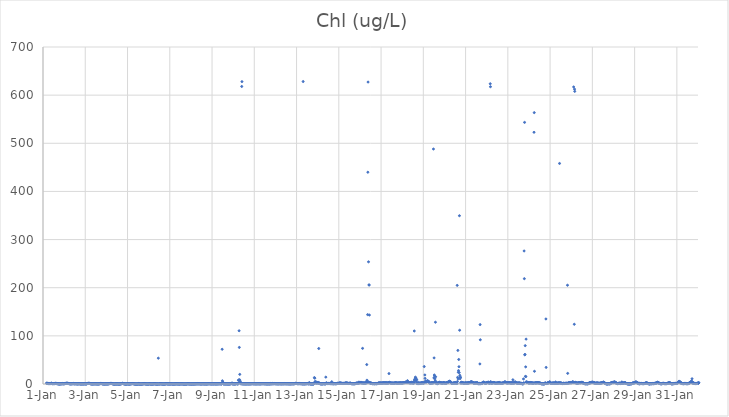
| Category | Chl (ug/L) |
|---|---|
| 44927.166666666664 | 1.62 |
| 44927.177083333336 | 1.46 |
| 44927.1875 | 1.29 |
| 44927.197916666664 | 1.34 |
| 44927.208333333336 | 1.28 |
| 44927.21875 | 1.24 |
| 44927.229166666664 | 1.07 |
| 44927.239583333336 | 1.19 |
| 44927.25 | 1.12 |
| 44927.260416666664 | 0.93 |
| 44927.270833333336 | 0.9 |
| 44927.28125 | 0.76 |
| 44927.291666666664 | 0.87 |
| 44927.302083333336 | 0.89 |
| 44927.3125 | 1.02 |
| 44927.322916666664 | 0.82 |
| 44927.333333333336 | 1 |
| 44927.34375 | 0.92 |
| 44927.354166666664 | 0.98 |
| 44927.364583333336 | 0.98 |
| 44927.375 | 1.19 |
| 44927.385416666664 | 1.48 |
| 44927.395833333336 | 1.44 |
| 44927.40625 | 1.44 |
| 44927.416666666664 | 0.9 |
| 44927.427083333336 | 1.05 |
| 44927.4375 | 0.78 |
| 44927.447916666664 | 0.77 |
| 44927.458333333336 | 0.76 |
| 44927.46875 | 0.76 |
| 44927.479166666664 | 0.8 |
| 44927.489583333336 | 0.79 |
| 44927.5 | 0.9 |
| 44927.510416666664 | 0.76 |
| 44927.520833333336 | 0.71 |
| 44927.53125 | 0.83 |
| 44927.541666666664 | 0.79 |
| 44927.552083333336 | 0.93 |
| 44927.5625 | 1.12 |
| 44927.572916666664 | 1.22 |
| 44927.583333333336 | 1.12 |
| 44927.59375 | 1.28 |
| 44927.604166666664 | 1.14 |
| 44927.614583333336 | 0.78 |
| 44927.625 | 0.62 |
| 44927.635416666664 | 1.13 |
| 44927.645833333336 | 1 |
| 44927.65625 | 1.3 |
| 44927.666666666664 | 0.84 |
| 44927.677083333336 | 0.74 |
| 44927.6875 | 0.61 |
| 44927.697916666664 | 0.71 |
| 44927.708333333336 | 0.53 |
| 44927.71875 | 0.44 |
| 44927.729166666664 | 0.38 |
| 44927.739583333336 | 0.39 |
| 44927.75 | 0.42 |
| 44927.760416666664 | 0.35 |
| 44927.770833333336 | 0.23 |
| 44927.78125 | 0.2 |
| 44927.791666666664 | 0.32 |
| 44927.802083333336 | 0.32 |
| 44927.8125 | 0.39 |
| 44927.822916666664 | 0.37 |
| 44927.833333333336 | 0.41 |
| 44927.84375 | 0.5 |
| 44927.854166666664 | 0.48 |
| 44927.864583333336 | 0.61 |
| 44927.875 | 0.53 |
| 44927.885416666664 | 0.54 |
| 44927.895833333336 | 0.56 |
| 44927.90625 | 0.61 |
| 44927.916666666664 | 1.15 |
| 44927.927083333336 | 0.53 |
| 44927.9375 | 0.47 |
| 44927.947916666664 | 0.58 |
| 44927.958333333336 | 0.48 |
| 44927.96875 | 0.55 |
| 44927.979166666664 | 0.62 |
| 44927.989583333336 | 0.61 |
| 44928.0 | 0.63 |
| 44928.010416666664 | 0.57 |
| 44928.020833333336 | 0.76 |
| 44928.03125 | 1.01 |
| 44928.041666666664 | 1.08 |
| 44928.052083333336 | 1.03 |
| 44928.0625 | 1.13 |
| 44928.072916666664 | 1.13 |
| 44928.083333333336 | 1.21 |
| 44928.09375 | 1.23 |
| 44928.104166666664 | 1.37 |
| 44928.114583333336 | 1.41 |
| 44928.125 | 1.52 |
| 44928.135416666664 | 1.38 |
| 44928.145833333336 | 1.45 |
| 44928.15625 | 1.47 |
| 44928.166666666664 | 1.27 |
| 44928.177083333336 | 1.21 |
| 44928.1875 | 1.04 |
| 44928.197916666664 | 1.23 |
| 44928.208333333336 | 1.02 |
| 44928.21875 | 0.82 |
| 44928.229166666664 | 0.87 |
| 44928.239583333336 | 0.7 |
| 44928.25 | 0.67 |
| 44928.260416666664 | 0.64 |
| 44928.270833333336 | 0.51 |
| 44928.28125 | 0.47 |
| 44928.291666666664 | 0.48 |
| 44928.302083333336 | 0.51 |
| 44928.3125 | 0.41 |
| 44928.322916666664 | 0.45 |
| 44928.333333333336 | 0.54 |
| 44928.34375 | 0.48 |
| 44928.354166666664 | 0.48 |
| 44928.364583333336 | 0.57 |
| 44928.375 | 0.67 |
| 44928.385416666664 | 0.68 |
| 44928.395833333336 | 0.59 |
| 44928.40625 | 0.73 |
| 44928.416666666664 | 0.72 |
| 44928.427083333336 | 0.86 |
| 44928.4375 | 1.18 |
| 44928.447916666664 | 0.52 |
| 44928.458333333336 | 0.6 |
| 44928.46875 | 0.5 |
| 44928.479166666664 | 0.46 |
| 44928.489583333336 | 0.65 |
| 44928.5 | 0.54 |
| 44928.510416666664 | 0.52 |
| 44928.520833333336 | 0.6 |
| 44928.53125 | 0.65 |
| 44928.541666666664 | 0.55 |
| 44928.552083333336 | 0.58 |
| 44928.5625 | 0.59 |
| 44928.572916666664 | 0.48 |
| 44928.583333333336 | 0.48 |
| 44928.59375 | 0.46 |
| 44928.604166666664 | 0.5 |
| 44928.614583333336 | 0.46 |
| 44928.625 | 0.42 |
| 44928.635416666664 | 0.28 |
| 44928.645833333336 | 0.43 |
| 44928.65625 | 0.39 |
| 44928.666666666664 | 0.41 |
| 44928.677083333336 | 0.36 |
| 44928.6875 | 0.57 |
| 44928.697916666664 | 0.75 |
| 44928.708333333336 | 0.72 |
| 44928.71875 | 0.43 |
| 44928.729166666664 | 0.57 |
| 44928.739583333336 | 0.57 |
| 44928.75 | 0.45 |
| 44928.760416666664 | 0.35 |
| 44928.770833333336 | 0.36 |
| 44928.78125 | 0.36 |
| 44928.791666666664 | 0.3 |
| 44928.802083333336 | 0.15 |
| 44928.8125 | 0.44 |
| 44928.822916666664 | 0.44 |
| 44928.833333333336 | 0.32 |
| 44928.84375 | 0.28 |
| 44928.854166666664 | 0.38 |
| 44928.864583333336 | 0.4 |
| 44928.875 | 0.39 |
| 44928.885416666664 | 0.36 |
| 44928.895833333336 | 0.37 |
| 44928.90625 | 0.27 |
| 44928.916666666664 | 0.37 |
| 44928.927083333336 | 0.31 |
| 44928.9375 | 0.45 |
| 44928.947916666664 | 0.68 |
| 44928.958333333336 | 0.43 |
| 44928.96875 | 0.44 |
| 44928.979166666664 | 0.36 |
| 44928.989583333336 | 0.47 |
| 44929.0 | 0.26 |
| 44929.010416666664 | 0.45 |
| 44929.020833333336 | 0.38 |
| 44929.03125 | 0.33 |
| 44929.041666666664 | 0.3 |
| 44929.052083333336 | 0.28 |
| 44929.0625 | 0.49 |
| 44929.072916666664 | 0.59 |
| 44929.083333333336 | 0.7 |
| 44929.09375 | 0.87 |
| 44929.104166666664 | 1.04 |
| 44929.114583333336 | 1.15 |
| 44929.125 | 1.02 |
| 44929.135416666664 | 1.02 |
| 44929.145833333336 | 1.18 |
| 44929.15625 | 1.23 |
| 44929.166666666664 | 1.52 |
| 44929.177083333336 | 1.23 |
| 44929.1875 | 1.27 |
| 44929.197916666664 | 1.28 |
| 44929.208333333336 | 1.11 |
| 44929.21875 | 0.99 |
| 44929.229166666664 | 0.86 |
| 44929.239583333336 | 0.62 |
| 44929.25 | 0.74 |
| 44929.260416666664 | 0.49 |
| 44929.270833333336 | 0.5 |
| 44929.28125 | 0.39 |
| 44929.291666666664 | 0.3 |
| 44929.302083333336 | 0.37 |
| 44929.3125 | 0.29 |
| 44929.322916666664 | 0.38 |
| 44929.333333333336 | 0.35 |
| 44929.34375 | 0.34 |
| 44929.354166666664 | 0.31 |
| 44929.364583333336 | 0.27 |
| 44929.375 | 0.38 |
| 44929.385416666664 | 0.38 |
| 44929.395833333336 | 0.47 |
| 44929.40625 | 0.36 |
| 44929.416666666664 | 0.46 |
| 44929.427083333336 | 0.42 |
| 44929.4375 | 0.46 |
| 44929.447916666664 | 0.43 |
| 44929.458333333336 | 0.66 |
| 44929.46875 | 0.42 |
| 44929.479166666664 | 0.45 |
| 44929.489583333336 | 0.45 |
| 44929.5 | 0.51 |
| 44929.510416666664 | 0.41 |
| 44929.520833333336 | 0.44 |
| 44929.53125 | 0.41 |
| 44929.541666666664 | 0.35 |
| 44929.552083333336 | 0.45 |
| 44929.5625 | 0.25 |
| 44929.572916666664 | 0.43 |
| 44929.583333333336 | 0.26 |
| 44929.59375 | 0.26 |
| 44929.604166666664 | 0.25 |
| 44929.614583333336 | 0.37 |
| 44929.625 | 0.22 |
| 44929.635416666664 | 0.35 |
| 44929.645833333336 | 0.4 |
| 44929.65625 | 0.53 |
| 44929.666666666664 | 0.45 |
| 44929.677083333336 | 0.54 |
| 44929.6875 | 0.62 |
| 44929.697916666664 | 0.72 |
| 44929.708333333336 | 0.56 |
| 44929.71875 | 1.03 |
| 44929.729166666664 | 1.12 |
| 44929.739583333336 | 1.1 |
| 44929.75 | 1.09 |
| 44929.760416666664 | 0.93 |
| 44929.770833333336 | 0.91 |
| 44929.78125 | 0.77 |
| 44929.791666666664 | 0.61 |
| 44929.802083333336 | 0.46 |
| 44929.8125 | 0.41 |
| 44929.822916666664 | 0.51 |
| 44929.833333333336 | 0.43 |
| 44929.84375 | 0.22 |
| 44929.854166666664 | 0.31 |
| 44929.864583333336 | 0.37 |
| 44929.875 | 0.35 |
| 44929.885416666664 | 0.21 |
| 44929.895833333336 | 0.27 |
| 44929.90625 | 0.21 |
| 44929.916666666664 | 0.15 |
| 44929.927083333336 | 0.25 |
| 44929.9375 | 0.21 |
| 44929.947916666664 | 0.31 |
| 44929.958333333336 | 0.33 |
| 44929.96875 | 0.36 |
| 44929.979166666664 | 0.27 |
| 44929.989583333336 | 0.46 |
| 44930.0 | 0.3 |
| 44930.010416666664 | 0.21 |
| 44930.020833333336 | 0.35 |
| 44930.03125 | 0.39 |
| 44930.041666666664 | 0.25 |
| 44930.052083333336 | 0.4 |
| 44930.0625 | 0.34 |
| 44930.072916666664 | 0.35 |
| 44930.083333333336 | 0.36 |
| 44930.09375 | 0.3 |
| 44930.104166666664 | 0.64 |
| 44930.114583333336 | 0.56 |
| 44930.125 | 0.8 |
| 44930.135416666664 | 0.78 |
| 44930.145833333336 | 0.84 |
| 44930.15625 | 0.8 |
| 44930.166666666664 | 0.83 |
| 44930.177083333336 | 1.03 |
| 44930.1875 | 1.09 |
| 44930.197916666664 | 1.13 |
| 44930.208333333336 | 0.98 |
| 44930.21875 | 1.17 |
| 44930.229166666664 | 1.16 |
| 44930.239583333336 | 1.05 |
| 44930.25 | 1 |
| 44930.260416666664 | 1.04 |
| 44930.270833333336 | 0.82 |
| 44930.28125 | 0.79 |
| 44930.291666666664 | 0.57 |
| 44930.302083333336 | 0.45 |
| 44930.3125 | 0.35 |
| 44930.322916666664 | 0.26 |
| 44930.333333333336 | 0.26 |
| 44930.34375 | 0.24 |
| 44930.354166666664 | 0.13 |
| 44930.364583333336 | 0.09 |
| 44930.375 | 0.08 |
| 44930.385416666664 | 0.1 |
| 44930.395833333336 | 0.13 |
| 44930.40625 | 0.16 |
| 44930.416666666664 | 0.12 |
| 44930.427083333336 | 0.21 |
| 44930.4375 | 0.2 |
| 44930.447916666664 | 0.64 |
| 44930.458333333336 | 0.23 |
| 44930.46875 | 0.17 |
| 44930.479166666664 | 0.2 |
| 44930.489583333336 | 0.24 |
| 44930.5 | 0.3 |
| 44930.510416666664 | 0.75 |
| 44930.520833333336 | 0.15 |
| 44930.53125 | 0.21 |
| 44930.541666666664 | 0.25 |
| 44930.552083333336 | 0.14 |
| 44930.5625 | 0.07 |
| 44930.572916666664 | 0.16 |
| 44930.583333333336 | 0.19 |
| 44930.59375 | 0.17 |
| 44930.604166666664 | 0.25 |
| 44930.614583333336 | 0.16 |
| 44930.625 | 0.06 |
| 44930.635416666664 | 0.09 |
| 44930.645833333336 | 0.11 |
| 44930.65625 | 0.27 |
| 44930.666666666664 | 0.58 |
| 44930.677083333336 | 0.3 |
| 44930.6875 | 0.58 |
| 44930.697916666664 | 0.26 |
| 44930.708333333336 | 0.67 |
| 44930.71875 | 0.91 |
| 44930.729166666664 | 0.8 |
| 44930.739583333336 | 1.09 |
| 44930.75 | 1.17 |
| 44930.760416666664 | 1.27 |
| 44930.770833333336 | 1.28 |
| 44930.78125 | 1.15 |
| 44930.791666666664 | 0.84 |
| 44930.802083333336 | 0.6 |
| 44930.8125 | 0.88 |
| 44930.822916666664 | 0.6 |
| 44930.833333333336 | 0.47 |
| 44930.84375 | 0.54 |
| 44930.854166666664 | 0.35 |
| 44930.864583333336 | 0.31 |
| 44930.875 | 0.14 |
| 44930.885416666664 | 0.11 |
| 44930.895833333336 | 0.17 |
| 44930.90625 | 0.16 |
| 44930.916666666664 | 0.13 |
| 44930.927083333336 | 0.12 |
| 44930.9375 | 0.11 |
| 44930.947916666664 | 0.13 |
| 44930.958333333336 | 0.2 |
| 44930.96875 | 0.24 |
| 44930.979166666664 | 0.35 |
| 44930.989583333336 | 0.37 |
| 44931.0 | 0.48 |
| 44931.010416666664 | 0.37 |
| 44931.020833333336 | 0.38 |
| 44931.03125 | 0.19 |
| 44931.041666666664 | 0.2 |
| 44931.052083333336 | 0.26 |
| 44931.0625 | 0.3 |
| 44931.072916666664 | 0.16 |
| 44931.083333333336 | 0.21 |
| 44931.09375 | 0.19 |
| 44931.104166666664 | 0.2 |
| 44931.114583333336 | 0.21 |
| 44931.125 | 0.24 |
| 44931.135416666664 | 0.32 |
| 44931.145833333336 | 0.5 |
| 44931.15625 | 0.53 |
| 44931.166666666664 | 0.63 |
| 44931.177083333336 | 0.62 |
| 44931.1875 | 0.59 |
| 44931.197916666664 | 0.59 |
| 44931.208333333336 | 0.66 |
| 44931.21875 | 0.74 |
| 44931.229166666664 | 0.89 |
| 44931.239583333336 | 0.81 |
| 44931.25 | 0.86 |
| 44931.260416666664 | 0.96 |
| 44931.270833333336 | 0.62 |
| 44931.28125 | 0.7 |
| 44931.291666666664 | 0.54 |
| 44931.302083333336 | 0.49 |
| 44931.3125 | 0.38 |
| 44931.322916666664 | 0.26 |
| 44931.333333333336 | 0.28 |
| 44931.34375 | 0.28 |
| 44931.354166666664 | 0.14 |
| 44931.364583333336 | 0.05 |
| 44931.375 | 0.07 |
| 44931.385416666664 | 0.11 |
| 44931.395833333336 | 0.1 |
| 44931.40625 | 0.09 |
| 44931.416666666664 | 0.12 |
| 44931.427083333336 | 0.1 |
| 44931.4375 | 0.14 |
| 44931.447916666664 | 0.16 |
| 44931.458333333336 | 0.03 |
| 44931.46875 | 0.17 |
| 44931.479166666664 | 0.1 |
| 44931.489583333336 | 0.22 |
| 44931.5 | 0.24 |
| 44931.510416666664 | 0.22 |
| 44931.520833333336 | 0.14 |
| 44931.53125 | 0.27 |
| 44931.541666666664 | 1.46 |
| 44931.552083333336 | 0.16 |
| 44931.5625 | 0.15 |
| 44931.572916666664 | 0.12 |
| 44931.583333333336 | 0.12 |
| 44931.59375 | 0.13 |
| 44931.604166666664 | 0.18 |
| 44931.614583333336 | 0.12 |
| 44931.625 | 0.26 |
| 44931.635416666664 | 0.1 |
| 44931.645833333336 | 0.08 |
| 44931.65625 | 0.15 |
| 44931.666666666664 | 0.18 |
| 44931.677083333336 | 0.08 |
| 44931.6875 | 0.23 |
| 44931.697916666664 | 0.35 |
| 44931.708333333336 | 0.33 |
| 44931.71875 | 0.38 |
| 44931.729166666664 | 0.19 |
| 44931.739583333336 | 0.36 |
| 44931.75 | 0.64 |
| 44931.760416666664 | 0.51 |
| 44931.770833333336 | 0.67 |
| 44931.78125 | 0.85 |
| 44931.791666666664 | 0.94 |
| 44931.802083333336 | 0.53 |
| 44931.8125 | 0.72 |
| 44931.822916666664 | 0.42 |
| 44931.833333333336 | 0.37 |
| 44931.84375 | 0.34 |
| 44931.854166666664 | 0.36 |
| 44931.864583333336 | 0.28 |
| 44931.875 | 0.32 |
| 44931.885416666664 | 0.25 |
| 44931.895833333336 | 0.18 |
| 44931.90625 | 0.18 |
| 44931.916666666664 | 0.2 |
| 44931.927083333336 | 0.23 |
| 44931.9375 | 0.12 |
| 44931.947916666664 | 0.14 |
| 44931.958333333336 | 0.27 |
| 44931.96875 | 0.16 |
| 44931.979166666664 | 0.17 |
| 44931.989583333336 | 0.24 |
| 44932.0 | 0.16 |
| 44932.010416666664 | 0.2 |
| 44932.020833333336 | 0.17 |
| 44932.03125 | 0.76 |
| 44932.041666666664 | 0.43 |
| 44932.052083333336 | 0.5 |
| 44932.0625 | 0.4 |
| 44932.072916666664 | 0.19 |
| 44932.083333333336 | 0.17 |
| 44932.09375 | 0.22 |
| 44932.104166666664 | 0.3 |
| 44932.114583333336 | 0.22 |
| 44932.125 | 0.22 |
| 44932.135416666664 | 0.23 |
| 44932.145833333336 | 0.13 |
| 44932.15625 | 0.17 |
| 44932.166666666664 | 0.13 |
| 44932.177083333336 | 0.29 |
| 44932.1875 | 0.19 |
| 44932.197916666664 | 0.2 |
| 44932.208333333336 | 0.31 |
| 44932.21875 | 0.29 |
| 44932.229166666664 | 0.36 |
| 44932.239583333336 | 0.38 |
| 44932.25 | 0.37 |
| 44932.260416666664 | 0.42 |
| 44932.270833333336 | 0.59 |
| 44932.28125 | 0.5 |
| 44932.291666666664 | 0.52 |
| 44932.302083333336 | 0.46 |
| 44932.3125 | 0.43 |
| 44932.322916666664 | 0.25 |
| 44932.333333333336 | 0.29 |
| 44932.34375 | 0.18 |
| 44932.354166666664 | 0.16 |
| 44932.364583333336 | 0.24 |
| 44932.375 | 0.15 |
| 44932.385416666664 | 0.11 |
| 44932.395833333336 | 0.13 |
| 44932.40625 | 0.18 |
| 44932.416666666664 | 0.13 |
| 44932.427083333336 | 0.14 |
| 44932.4375 | 0.16 |
| 44932.447916666664 | 0.16 |
| 44932.458333333336 | 53.65 |
| 44932.46875 | 0.1 |
| 44932.479166666664 | 0.21 |
| 44932.489583333336 | 0.18 |
| 44932.5 | 0.25 |
| 44932.510416666664 | 0.28 |
| 44932.520833333336 | 0.38 |
| 44932.53125 | 0.4 |
| 44932.541666666664 | 0.48 |
| 44932.552083333336 | 0.61 |
| 44932.5625 | 0.41 |
| 44932.572916666664 | 0.4 |
| 44932.583333333336 | 0.47 |
| 44932.59375 | 0.38 |
| 44932.604166666664 | 0.5 |
| 44932.614583333336 | 0.21 |
| 44932.625 | 0.24 |
| 44932.635416666664 | 0.33 |
| 44932.645833333336 | 0.31 |
| 44932.65625 | 0.16 |
| 44932.666666666664 | 0.13 |
| 44932.677083333336 | 0.09 |
| 44932.6875 | 0.12 |
| 44932.697916666664 | 0.15 |
| 44932.708333333336 | 0.22 |
| 44932.71875 | 0.11 |
| 44932.729166666664 | 0.1 |
| 44932.739583333336 | 0.1 |
| 44932.75 | 0.16 |
| 44932.760416666664 | 0.09 |
| 44932.770833333336 | 0.29 |
| 44932.78125 | 0.34 |
| 44932.791666666664 | 0.28 |
| 44932.802083333336 | 0.18 |
| 44932.8125 | 0.45 |
| 44932.822916666664 | 0.68 |
| 44932.833333333336 | 0.7 |
| 44932.84375 | 0.66 |
| 44932.854166666664 | 0.52 |
| 44932.864583333336 | 0.37 |
| 44932.875 | 0.37 |
| 44932.885416666664 | 0.39 |
| 44932.895833333336 | 0.32 |
| 44932.90625 | 0.34 |
| 44932.916666666664 | 0.38 |
| 44932.927083333336 | 0.34 |
| 44932.9375 | 0.16 |
| 44932.947916666664 | 0.31 |
| 44932.958333333336 | 0.34 |
| 44932.96875 | 0.32 |
| 44932.979166666664 | 0.23 |
| 44932.989583333336 | 0.29 |
| 44933.0 | 0.34 |
| 44933.010416666664 | 0.14 |
| 44933.020833333336 | 0.25 |
| 44933.03125 | 0.26 |
| 44933.041666666664 | 0.31 |
| 44933.052083333336 | 0.38 |
| 44933.0625 | 0.44 |
| 44933.072916666664 | 0.56 |
| 44933.083333333336 | 0.41 |
| 44933.09375 | 0.3 |
| 44933.104166666664 | 0.28 |
| 44933.114583333336 | 0.25 |
| 44933.125 | 0.18 |
| 44933.135416666664 | 0.28 |
| 44933.145833333336 | 0.11 |
| 44933.15625 | 0.31 |
| 44933.166666666664 | 0.18 |
| 44933.177083333336 | 0.2 |
| 44933.1875 | 0.17 |
| 44933.197916666664 | 0.17 |
| 44933.208333333336 | 0.14 |
| 44933.21875 | 0.28 |
| 44933.229166666664 | 0.27 |
| 44933.239583333336 | 0.23 |
| 44933.25 | 0.33 |
| 44933.260416666664 | 0.31 |
| 44933.270833333336 | 0.36 |
| 44933.28125 | 0.33 |
| 44933.291666666664 | 0.36 |
| 44933.302083333336 | 0.37 |
| 44933.3125 | 0.41 |
| 44933.322916666664 | 0.49 |
| 44933.333333333336 | 0.41 |
| 44933.34375 | 0.4 |
| 44933.354166666664 | 0.33 |
| 44933.364583333336 | 0.36 |
| 44933.375 | 0.29 |
| 44933.385416666664 | 0.29 |
| 44933.395833333336 | 0.26 |
| 44933.40625 | 0.3 |
| 44933.416666666664 | 0.31 |
| 44933.427083333336 | 0.34 |
| 44933.4375 | 0.21 |
| 44933.447916666664 | 0.14 |
| 44933.458333333336 | 0.22 |
| 44933.46875 | 0.26 |
| 44933.479166666664 | 0.25 |
| 44933.489583333336 | 0.17 |
| 44933.5 | 0.33 |
| 44933.510416666664 | 0.52 |
| 44933.520833333336 | 0.36 |
| 44933.53125 | 0.4 |
| 44933.541666666664 | 0.39 |
| 44933.552083333336 | 0.4 |
| 44933.5625 | 0.32 |
| 44933.572916666664 | 0.39 |
| 44933.583333333336 | 0.42 |
| 44933.59375 | 0.65 |
| 44933.604166666664 | 0.39 |
| 44933.614583333336 | 0.22 |
| 44933.625 | 0.2 |
| 44933.635416666664 | 0.13 |
| 44933.645833333336 | 0.24 |
| 44933.65625 | 0.22 |
| 44933.666666666664 | 0.13 |
| 44933.677083333336 | 0.12 |
| 44933.6875 | 0.16 |
| 44933.697916666664 | 0.21 |
| 44933.708333333336 | 0.15 |
| 44933.71875 | 0.15 |
| 44933.729166666664 | 0.16 |
| 44933.739583333336 | 0.17 |
| 44933.75 | 0.2 |
| 44933.760416666664 | 0.15 |
| 44933.770833333336 | 0.14 |
| 44933.78125 | 0.21 |
| 44933.791666666664 | 0.2 |
| 44933.802083333336 | 0.27 |
| 44933.8125 | 0.2 |
| 44933.822916666664 | 0.29 |
| 44933.833333333336 | 0.5 |
| 44933.84375 | 0.63 |
| 44933.854166666664 | 0.59 |
| 44933.864583333336 | 0.71 |
| 44933.875 | 0.51 |
| 44933.885416666664 | 0.38 |
| 44933.895833333336 | 0.34 |
| 44933.90625 | 0.42 |
| 44933.916666666664 | 0.34 |
| 44933.927083333336 | 0.28 |
| 44933.9375 | 0.28 |
| 44933.947916666664 | 0.35 |
| 44933.958333333336 | 0.34 |
| 44933.96875 | 0.26 |
| 44933.979166666664 | 0.27 |
| 44933.989583333336 | 0.25 |
| 44934.0 | 0.29 |
| 44934.010416666664 | 0.26 |
| 44934.020833333336 | 0.19 |
| 44934.03125 | 0.17 |
| 44934.041666666664 | 0.3 |
| 44934.052083333336 | 0.2 |
| 44934.0625 | 0.29 |
| 44934.072916666664 | 0.27 |
| 44934.083333333336 | 0.38 |
| 44934.09375 | 0.2 |
| 44934.104166666664 | 0.37 |
| 44934.114583333336 | 0.29 |
| 44934.125 | 0.24 |
| 44934.135416666664 | 0.13 |
| 44934.145833333336 | 0.27 |
| 44934.15625 | 0.29 |
| 44934.166666666664 | 0.37 |
| 44934.177083333336 | 0.28 |
| 44934.1875 | 0.41 |
| 44934.197916666664 | 0.29 |
| 44934.208333333336 | 0.33 |
| 44934.21875 | 0.37 |
| 44934.229166666664 | 0.38 |
| 44934.239583333336 | 0.47 |
| 44934.25 | 0.4 |
| 44934.260416666664 | 0.48 |
| 44934.270833333336 | 0.48 |
| 44934.28125 | 0.49 |
| 44934.291666666664 | 0.44 |
| 44934.302083333336 | 0.4 |
| 44934.3125 | 0.47 |
| 44934.322916666664 | 0.55 |
| 44934.333333333336 | 1 |
| 44934.34375 | 0.53 |
| 44934.354166666664 | 0.53 |
| 44934.364583333336 | 0.46 |
| 44934.375 | 0.46 |
| 44934.385416666664 | 0.37 |
| 44934.395833333336 | 0.55 |
| 44934.40625 | 0.59 |
| 44934.416666666664 | 0.45 |
| 44934.427083333336 | 0.36 |
| 44934.4375 | 0.4 |
| 44934.447916666664 | 0.39 |
| 44934.458333333336 | 0.27 |
| 44934.46875 | 0.35 |
| 44934.479166666664 | 0.25 |
| 44934.489583333336 | 0.35 |
| 44934.5 | 0.35 |
| 44934.510416666664 | 0.38 |
| 44934.520833333336 | 0.41 |
| 44934.53125 | 0.39 |
| 44934.541666666664 | 0.49 |
| 44934.552083333336 | 0.46 |
| 44934.5625 | 0.47 |
| 44934.572916666664 | 0.56 |
| 44934.583333333336 | 0.46 |
| 44934.59375 | 0.41 |
| 44934.604166666664 | 0.42 |
| 44934.614583333336 | 0.37 |
| 44934.625 | 0.29 |
| 44934.635416666664 | 0.35 |
| 44934.645833333336 | 0.3 |
| 44934.65625 | 0.37 |
| 44934.666666666664 | 0.43 |
| 44934.677083333336 | 0.31 |
| 44934.6875 | 0.27 |
| 44934.697916666664 | 0.33 |
| 44934.708333333336 | 0.42 |
| 44934.71875 | 0.3 |
| 44934.729166666664 | 0.31 |
| 44934.739583333336 | 0.23 |
| 44934.75 | 0.21 |
| 44934.760416666664 | 0.31 |
| 44934.770833333336 | 0.39 |
| 44934.78125 | 0.29 |
| 44934.791666666664 | 0.52 |
| 44934.802083333336 | 0.43 |
| 44934.8125 | 0.57 |
| 44934.822916666664 | 0.52 |
| 44934.833333333336 | 0.4 |
| 44934.84375 | 0.73 |
| 44934.854166666664 | 0.46 |
| 44934.864583333336 | 0.37 |
| 44934.875 | 0.57 |
| 44934.885416666664 | 0.69 |
| 44934.895833333336 | 0.53 |
| 44934.90625 | 0.55 |
| 44934.916666666664 | 0.45 |
| 44934.927083333336 | 0.38 |
| 44934.9375 | 0.47 |
| 44934.947916666664 | 0.37 |
| 44934.958333333336 | 0.38 |
| 44934.96875 | 0.37 |
| 44934.979166666664 | 0.38 |
| 44934.989583333336 | 0.36 |
| 44935.0 | 0.38 |
| 44935.010416666664 | 0.46 |
| 44935.020833333336 | 0.39 |
| 44935.03125 | 0.49 |
| 44935.041666666664 | 0.43 |
| 44935.052083333336 | 0.27 |
| 44935.0625 | 0.33 |
| 44935.072916666664 | 0.33 |
| 44935.083333333336 | 0.47 |
| 44935.09375 | 0.5 |
| 44935.104166666664 | 0.47 |
| 44935.114583333336 | 0.53 |
| 44935.125 | 0.52 |
| 44935.135416666664 | 0.31 |
| 44935.145833333336 | 0.35 |
| 44935.15625 | 0.42 |
| 44935.166666666664 | 0.4 |
| 44935.177083333336 | 0.29 |
| 44935.1875 | 0.37 |
| 44935.197916666664 | 0.33 |
| 44935.208333333336 | 0.36 |
| 44935.21875 | 0.48 |
| 44935.229166666664 | 0.37 |
| 44935.239583333336 | 0.33 |
| 44935.25 | 0.51 |
| 44935.260416666664 | 0.42 |
| 44935.270833333336 | 0.39 |
| 44935.28125 | 0.49 |
| 44935.291666666664 | 0.44 |
| 44935.302083333336 | 0.46 |
| 44935.3125 | 0.48 |
| 44935.322916666664 | 0.58 |
| 44935.333333333336 | 0.47 |
| 44935.34375 | 0.52 |
| 44935.354166666664 | 0.65 |
| 44935.364583333336 | 0.58 |
| 44935.375 | 0.49 |
| 44935.385416666664 | 0.55 |
| 44935.395833333336 | 0.57 |
| 44935.40625 | 0.45 |
| 44935.416666666664 | 0.52 |
| 44935.427083333336 | 0.4 |
| 44935.4375 | 0.37 |
| 44935.447916666664 | 0.42 |
| 44935.458333333336 | 0.45 |
| 44935.46875 | 0.36 |
| 44935.479166666664 | 72.11 |
| 44935.489583333336 | 6.62 |
| 44935.5 | 2.35 |
| 44935.510416666664 | 3.86 |
| 44935.520833333336 | 3.15 |
| 44935.53125 | 1.41 |
| 44935.541666666664 | 0.26 |
| 44935.552083333336 | 0.33 |
| 44935.5625 | 0.33 |
| 44935.572916666664 | 0.35 |
| 44935.583333333336 | 0.33 |
| 44935.59375 | 0.44 |
| 44935.604166666664 | 0.36 |
| 44935.614583333336 | 0.42 |
| 44935.625 | 0.38 |
| 44935.635416666664 | 0.27 |
| 44935.645833333336 | 0.31 |
| 44935.65625 | 0.35 |
| 44935.666666666664 | 0.36 |
| 44935.677083333336 | 0.35 |
| 44935.6875 | 0.35 |
| 44935.697916666664 | 0.35 |
| 44935.708333333336 | 0.35 |
| 44935.71875 | 0.3 |
| 44935.729166666664 | 0.18 |
| 44935.739583333336 | 0.23 |
| 44935.75 | 0.33 |
| 44935.760416666664 | 0.26 |
| 44935.770833333336 | 0.29 |
| 44935.78125 | 0.27 |
| 44935.791666666664 | 0.3 |
| 44935.802083333336 | 0.2 |
| 44935.8125 | 0.21 |
| 44935.822916666664 | 0.24 |
| 44935.833333333336 | 0.31 |
| 44935.84375 | 0.34 |
| 44935.854166666664 | 0.47 |
| 44935.864583333336 | 0.57 |
| 44935.875 | 0.55 |
| 44935.885416666664 | 0.54 |
| 44935.895833333336 | 0.52 |
| 44935.90625 | 0.43 |
| 44935.916666666664 | 1.08 |
| 44935.927083333336 | 1.52 |
| 44935.9375 | 0.86 |
| 44935.947916666664 | 0.75 |
| 44935.958333333336 | 1.86 |
| 44935.96875 | 0.23 |
| 44935.979166666664 | 0.41 |
| 44935.989583333336 | 0.35 |
| 44936.0 | 0.38 |
| 44936.010416666664 | 0.31 |
| 44936.020833333336 | 0.47 |
| 44936.03125 | 0.35 |
| 44936.041666666664 | 0.39 |
| 44936.052083333336 | 0.36 |
| 44936.0625 | 0.23 |
| 44936.072916666664 | 0.29 |
| 44936.083333333336 | 0.34 |
| 44936.09375 | 0.29 |
| 44936.104166666664 | 0.39 |
| 44936.114583333336 | 0.45 |
| 44936.125 | 0.5 |
| 44936.135416666664 | 0.48 |
| 44936.145833333336 | 0.83 |
| 44936.15625 | 0.89 |
| 44936.166666666664 | 0.79 |
| 44936.177083333336 | 0.38 |
| 44936.1875 | 0.49 |
| 44936.197916666664 | 0.45 |
| 44936.208333333336 | 0.46 |
| 44936.21875 | 0.46 |
| 44936.229166666664 | 0.35 |
| 44936.239583333336 | 0.42 |
| 44936.25 | 7.59 |
| 44936.260416666664 | 8.3 |
| 44936.270833333336 | 2.1 |
| 44936.28125 | 110.62 |
| 44936.291666666664 | 75.99 |
| 44936.302083333336 | 8.95 |
| 44936.3125 | 20 |
| 44936.322916666664 | 2.78 |
| 44936.333333333336 | 5.96 |
| 44936.34375 | 3.76 |
| 44936.354166666664 | 0.66 |
| 44936.364583333336 | 0.66 |
| 44936.375 | 0.78 |
| 44936.385416666664 | 0.47 |
| 44936.395833333336 | 0.57 |
| 44936.40625 | 618.04 |
| 44936.416666666664 | 628.09 |
| 44936.427083333336 | 0.56 |
| 44936.4375 | 0.62 |
| 44936.447916666664 | 0.47 |
| 44936.458333333336 | 0.45 |
| 44936.46875 | 0.41 |
| 44936.479166666664 | 0.47 |
| 44936.489583333336 | 0.47 |
| 44936.5 | 0.5 |
| 44936.510416666664 | 0.43 |
| 44936.520833333336 | 0.42 |
| 44936.53125 | 0.38 |
| 44936.541666666664 | 0.43 |
| 44936.552083333336 | 0.43 |
| 44936.5625 | 0.46 |
| 44936.572916666664 | 0.37 |
| 44936.583333333336 | 0.35 |
| 44936.59375 | 0.43 |
| 44936.604166666664 | 0.39 |
| 44936.614583333336 | 0.32 |
| 44936.625 | 0.37 |
| 44936.635416666664 | 0.43 |
| 44936.645833333336 | 0.41 |
| 44936.65625 | 0.49 |
| 44936.666666666664 | 0.5 |
| 44936.677083333336 | 0.49 |
| 44936.6875 | 0.48 |
| 44936.697916666664 | 0.34 |
| 44936.708333333336 | 0.32 |
| 44936.71875 | 0.41 |
| 44936.729166666664 | 0.36 |
| 44936.739583333336 | 0.44 |
| 44936.75 | 0.57 |
| 44936.760416666664 | 0.39 |
| 44936.770833333336 | 0.37 |
| 44936.78125 | 0.48 |
| 44936.791666666664 | 0.34 |
| 44936.802083333336 | 0.43 |
| 44936.8125 | 0.5 |
| 44936.822916666664 | 0.52 |
| 44936.833333333336 | 0.41 |
| 44936.84375 | 0.55 |
| 44936.854166666664 | 0.57 |
| 44936.864583333336 | 0.56 |
| 44936.875 | 0.67 |
| 44936.885416666664 | 0.56 |
| 44936.895833333336 | 0.61 |
| 44936.90625 | 0.85 |
| 44936.916666666664 | 0.62 |
| 44936.927083333336 | 0.65 |
| 44936.9375 | 0.71 |
| 44936.947916666664 | 0.66 |
| 44936.958333333336 | 0.47 |
| 44936.96875 | 0.55 |
| 44936.979166666664 | 0.54 |
| 44936.989583333336 | 0.49 |
| 44937.0 | 0.68 |
| 44937.010416666664 | 0.48 |
| 44937.020833333336 | 0.46 |
| 44937.03125 | 0.62 |
| 44937.041666666664 | 0.41 |
| 44937.052083333336 | 0.52 |
| 44937.0625 | 0.4 |
| 44937.072916666664 | 0.48 |
| 44937.083333333336 | 0.5 |
| 44937.09375 | 0.38 |
| 44937.104166666664 | 0.63 |
| 44937.114583333336 | 0.41 |
| 44937.125 | 0.48 |
| 44937.135416666664 | 0.49 |
| 44937.145833333336 | 0.47 |
| 44937.15625 | 0.56 |
| 44937.166666666664 | 0.53 |
| 44937.177083333336 | 0.56 |
| 44937.1875 | 0.69 |
| 44937.197916666664 | 0.45 |
| 44937.208333333336 | 0.5 |
| 44937.21875 | 0.5 |
| 44937.229166666664 | 0.56 |
| 44937.239583333336 | 0.42 |
| 44937.25 | 0.47 |
| 44937.260416666664 | 0.41 |
| 44937.270833333336 | 0.97 |
| 44937.28125 | 0.46 |
| 44937.291666666664 | 0.42 |
| 44937.302083333336 | 0.44 |
| 44937.3125 | 0.51 |
| 44937.322916666664 | 0.65 |
| 44937.333333333336 | 0.49 |
| 44937.34375 | 0.63 |
| 44937.354166666664 | 0.7 |
| 44937.364583333336 | 0.58 |
| 44937.375 | 0.62 |
| 44937.385416666664 | 0.64 |
| 44937.395833333336 | 0.71 |
| 44937.40625 | 0.7 |
| 44937.416666666664 | 0.73 |
| 44937.427083333336 | 0.63 |
| 44937.4375 | 0.67 |
| 44937.447916666664 | 0.7 |
| 44937.458333333336 | 0.59 |
| 44937.46875 | 0.5 |
| 44937.479166666664 | 0.51 |
| 44937.489583333336 | 0.54 |
| 44937.5 | 0.62 |
| 44937.510416666664 | 0.56 |
| 44937.520833333336 | 0.53 |
| 44937.53125 | 0.47 |
| 44937.541666666664 | 0.55 |
| 44937.552083333336 | 0.55 |
| 44937.5625 | 0.42 |
| 44937.572916666664 | 0.44 |
| 44937.583333333336 | 0.42 |
| 44937.59375 | 0.27 |
| 44937.604166666664 | 0.4 |
| 44937.614583333336 | 0.43 |
| 44937.625 | 0.48 |
| 44937.635416666664 | 0.36 |
| 44937.645833333336 | 0.4 |
| 44937.65625 | 0.41 |
| 44937.666666666664 | 0.37 |
| 44937.677083333336 | 0.46 |
| 44937.6875 | 0.39 |
| 44937.697916666664 | 0.55 |
| 44937.708333333336 | 0.43 |
| 44937.71875 | 0.38 |
| 44937.729166666664 | 0.39 |
| 44937.739583333336 | 0.33 |
| 44937.75 | 0.34 |
| 44937.760416666664 | 0.34 |
| 44937.770833333336 | 1.11 |
| 44937.78125 | 0.4 |
| 44937.791666666664 | 0.54 |
| 44937.802083333336 | 0.67 |
| 44937.8125 | 0.34 |
| 44937.822916666664 | 0.66 |
| 44937.833333333336 | 0.6 |
| 44937.84375 | 0.51 |
| 44937.854166666664 | 0.64 |
| 44937.864583333336 | 0.52 |
| 44937.875 | 1.33 |
| 44937.885416666664 | 0.73 |
| 44937.895833333336 | 0.69 |
| 44937.90625 | 0.68 |
| 44937.916666666664 | 0.68 |
| 44937.927083333336 | 0.69 |
| 44937.9375 | 0.97 |
| 44937.947916666664 | 0.89 |
| 44937.958333333336 | 0.7 |
| 44937.96875 | 0.74 |
| 44937.979166666664 | 0.6 |
| 44937.989583333336 | 0.64 |
| 44938.0 | 0.6 |
| 44938.010416666664 | 0.69 |
| 44938.020833333336 | 0.57 |
| 44938.03125 | 0.59 |
| 44938.041666666664 | 0.61 |
| 44938.052083333336 | 0.58 |
| 44938.0625 | 0.56 |
| 44938.072916666664 | 0.57 |
| 44938.083333333336 | 0.59 |
| 44938.09375 | 0.54 |
| 44938.104166666664 | 0.51 |
| 44938.114583333336 | 0.44 |
| 44938.125 | 0.49 |
| 44938.135416666664 | 0.54 |
| 44938.145833333336 | 0.48 |
| 44938.15625 | 0.54 |
| 44938.166666666664 | 0.52 |
| 44938.177083333336 | 0.51 |
| 44938.1875 | 0.56 |
| 44938.197916666664 | 0.56 |
| 44938.208333333336 | 0.75 |
| 44938.21875 | 0.62 |
| 44938.229166666664 | 0.49 |
| 44938.239583333336 | 0.51 |
| 44938.25 | 0.52 |
| 44938.260416666664 | 0.52 |
| 44938.270833333336 | 0.48 |
| 44938.28125 | 0.49 |
| 44938.291666666664 | 0.46 |
| 44938.302083333336 | 0.42 |
| 44938.3125 | 0.62 |
| 44938.322916666664 | 0.54 |
| 44938.333333333336 | 0.6 |
| 44938.34375 | 0.57 |
| 44938.354166666664 | 0.48 |
| 44938.364583333336 | 0.51 |
| 44938.375 | 0.57 |
| 44938.385416666664 | 0.57 |
| 44938.395833333336 | 0.55 |
| 44938.40625 | 0.52 |
| 44938.416666666664 | 0.59 |
| 44938.427083333336 | 0.52 |
| 44938.4375 | 0.7 |
| 44938.447916666664 | 0.86 |
| 44938.458333333336 | 0.65 |
| 44938.46875 | 0.7 |
| 44938.479166666664 | 0.57 |
| 44938.489583333336 | 0.52 |
| 44938.5 | 0.58 |
| 44938.510416666664 | 0.53 |
| 44938.520833333336 | 0.55 |
| 44938.53125 | 0.52 |
| 44938.541666666664 | 0.58 |
| 44938.552083333336 | 0.56 |
| 44938.5625 | 0.68 |
| 44938.572916666664 | 0.54 |
| 44938.583333333336 | 0.53 |
| 44938.59375 | 0.46 |
| 44938.604166666664 | 0.4 |
| 44938.614583333336 | 0.47 |
| 44938.625 | 0.47 |
| 44938.635416666664 | 0.58 |
| 44938.645833333336 | 0.53 |
| 44938.65625 | 0.43 |
| 44938.666666666664 | 0.41 |
| 44938.677083333336 | 0.45 |
| 44938.6875 | 0.62 |
| 44938.697916666664 | 0.32 |
| 44938.708333333336 | 0.47 |
| 44938.71875 | 0.47 |
| 44938.729166666664 | 0.44 |
| 44938.739583333336 | 0.33 |
| 44938.75 | 0.61 |
| 44938.760416666664 | 0.55 |
| 44938.770833333336 | 0.55 |
| 44938.78125 | 0.53 |
| 44938.791666666664 | 0.58 |
| 44938.802083333336 | 0.63 |
| 44938.8125 | 0.55 |
| 44938.822916666664 | 0.53 |
| 44938.833333333336 | 0.5 |
| 44938.84375 | 0.45 |
| 44938.854166666664 | 0.49 |
| 44938.864583333336 | 0.62 |
| 44938.875 | 0.59 |
| 44938.885416666664 | 0.64 |
| 44938.895833333336 | 0.56 |
| 44938.90625 | 0.84 |
| 44938.916666666664 | 0.79 |
| 44938.927083333336 | 0.73 |
| 44938.9375 | 0.87 |
| 44938.947916666664 | 1.11 |
| 44938.958333333336 | 1.54 |
| 44938.96875 | 1.1 |
| 44938.979166666664 | 0.97 |
| 44938.989583333336 | 1.16 |
| 44939.0 | 1.13 |
| 44939.010416666664 | 0.83 |
| 44939.020833333336 | 1.21 |
| 44939.03125 | 0.73 |
| 44939.041666666664 | 0.69 |
| 44939.052083333336 | 0.95 |
| 44939.0625 | 0.59 |
| 44939.072916666664 | 1.09 |
| 44939.083333333336 | 0.63 |
| 44939.09375 | 0.75 |
| 44939.104166666664 | 0.9 |
| 44939.114583333336 | 0.76 |
| 44939.125 | 0.64 |
| 44939.135416666664 | 0.74 |
| 44939.145833333336 | 1.07 |
| 44939.15625 | 1.13 |
| 44939.166666666664 | 0.96 |
| 44939.177083333336 | 0.74 |
| 44939.1875 | 0.86 |
| 44939.197916666664 | 0.6 |
| 44939.208333333336 | 0.63 |
| 44939.21875 | 0.69 |
| 44939.229166666664 | 0.72 |
| 44939.239583333336 | 0.64 |
| 44939.25 | 0.61 |
| 44939.260416666664 | 0.43 |
| 44939.270833333336 | 0.61 |
| 44939.28125 | 0.41 |
| 44939.291666666664 | 0.4 |
| 44939.302083333336 | 0.52 |
| 44939.3125 | 628.26 |
| 44939.322916666664 | 0.45 |
| 44939.333333333336 | 0.37 |
| 44939.34375 | 0.3 |
| 44939.354166666664 | 0.45 |
| 44939.364583333336 | 0.39 |
| 44939.375 | 0.35 |
| 44939.385416666664 | 0.43 |
| 44939.395833333336 | 0.65 |
| 44939.40625 | 0.48 |
| 44939.416666666664 | 0.54 |
| 44939.427083333336 | 0.56 |
| 44939.4375 | 0.61 |
| 44939.447916666664 | 0.59 |
| 44939.458333333336 | 0.64 |
| 44939.46875 | 0.62 |
| 44939.479166666664 | 0.68 |
| 44939.489583333336 | 0.64 |
| 44939.5 | 0.69 |
| 44939.510416666664 | 0.78 |
| 44939.520833333336 | 0.75 |
| 44939.53125 | 1.04 |
| 44939.541666666664 | 0.74 |
| 44939.552083333336 | 0.67 |
| 44939.5625 | 0.57 |
| 44939.572916666664 | 0.52 |
| 44939.583333333336 | 0.49 |
| 44939.59375 | 0.39 |
| 44939.604166666664 | 2.92 |
| 44939.614583333336 | 0.45 |
| 44939.625 | 0.9 |
| 44939.635416666664 | 1.5 |
| 44939.645833333336 | 0.29 |
| 44939.65625 | 0.31 |
| 44939.666666666664 | 0.33 |
| 44939.677083333336 | 0.27 |
| 44939.6875 | 0.31 |
| 44939.697916666664 | 0.31 |
| 44939.708333333336 | 0.22 |
| 44939.71875 | 0.23 |
| 44939.729166666664 | 0.29 |
| 44939.739583333336 | 0.31 |
| 44939.75 | 0.27 |
| 44939.760416666664 | 0.27 |
| 44939.770833333336 | 0.24 |
| 44939.78125 | 0.2 |
| 44939.791666666664 | 0.29 |
| 44939.802083333336 | 0.23 |
| 44939.8125 | 0.27 |
| 44939.822916666664 | 1.34 |
| 44939.833333333336 | 1.37 |
| 44939.84375 | 13.31 |
| 44939.854166666664 | 2.22 |
| 44939.864583333336 | 12.1 |
| 44939.875 | 5.05 |
| 44939.885416666664 | 2.65 |
| 44939.895833333336 | 2.19 |
| 44939.90625 | 4.28 |
| 44939.916666666664 | 2.41 |
| 44939.927083333336 | 4.22 |
| 44939.9375 | 2.07 |
| 44939.947916666664 | 1.84 |
| 44939.958333333336 | 1.93 |
| 44939.96875 | 2.36 |
| 44939.979166666664 | 3.16 |
| 44939.989583333336 | 2.15 |
| 44940.0 | 2.46 |
| 44940.010416666664 | 2.41 |
| 44940.020833333336 | 2 |
| 44940.03125 | 3.16 |
| 44940.041666666664 | 1.33 |
| 44940.052083333336 | 73.67 |
| 44940.0625 | 1.04 |
| 44940.072916666664 | 2.42 |
| 44940.083333333336 | 1.02 |
| 44940.09375 | 0.89 |
| 44940.104166666664 | 0.74 |
| 44940.114583333336 | 0.66 |
| 44940.125 | 0.61 |
| 44940.135416666664 | 0.48 |
| 44940.145833333336 | 0.47 |
| 44940.15625 | 0.46 |
| 44940.166666666664 | 0.37 |
| 44940.177083333336 | 0.45 |
| 44940.1875 | 0.38 |
| 44940.197916666664 | 0.36 |
| 44940.208333333336 | 0.65 |
| 44940.21875 | 0.4 |
| 44940.229166666664 | 0.4 |
| 44940.239583333336 | 0.42 |
| 44940.25 | 0.55 |
| 44940.260416666664 | 0.62 |
| 44940.270833333336 | 0.53 |
| 44940.28125 | 0.73 |
| 44940.291666666664 | 0.78 |
| 44940.302083333336 | 0.66 |
| 44940.3125 | 0.64 |
| 44940.322916666664 | 0.6 |
| 44940.333333333336 | 0.41 |
| 44940.34375 | 0.4 |
| 44940.354166666664 | 0.63 |
| 44940.364583333336 | 0.37 |
| 44940.375 | 0.38 |
| 44940.385416666664 | 14.26 |
| 44940.395833333336 | 0.88 |
| 44940.40625 | 2.4 |
| 44940.416666666664 | 0.99 |
| 44940.427083333336 | 1.81 |
| 44940.4375 | 0.82 |
| 44940.447916666664 | 0.79 |
| 44940.458333333336 | 1.12 |
| 44940.46875 | 0.86 |
| 44940.479166666664 | 1.26 |
| 44940.489583333336 | 1.08 |
| 44940.5 | 1.05 |
| 44940.510416666664 | 1.2 |
| 44940.520833333336 | 0.88 |
| 44940.53125 | 1.21 |
| 44940.541666666664 | 0.86 |
| 44940.552083333336 | 1.11 |
| 44940.5625 | 1.02 |
| 44940.572916666664 | 0.93 |
| 44940.583333333336 | 0.92 |
| 44940.59375 | 0.83 |
| 44940.604166666664 | 0.78 |
| 44940.614583333336 | 1.08 |
| 44940.625 | 0.87 |
| 44940.635416666664 | 0.83 |
| 44940.645833333336 | 0.8 |
| 44940.65625 | 0.79 |
| 44940.666666666664 | 4.73 |
| 44940.677083333336 | 0.69 |
| 44940.6875 | 0.73 |
| 44940.697916666664 | 0.82 |
| 44940.708333333336 | 0.72 |
| 44940.71875 | 0.74 |
| 44940.729166666664 | 0.64 |
| 44940.739583333336 | 0.61 |
| 44940.75 | 0.61 |
| 44940.760416666664 | 0.8 |
| 44940.770833333336 | 0.89 |
| 44940.78125 | 0.73 |
| 44940.791666666664 | 0.79 |
| 44940.802083333336 | 0.8 |
| 44940.8125 | 0.74 |
| 44940.822916666664 | 0.61 |
| 44940.833333333336 | 0.69 |
| 44940.84375 | 0.66 |
| 44940.854166666664 | 0.72 |
| 44940.864583333336 | 0.73 |
| 44940.875 | 0.8 |
| 44940.885416666664 | 0.75 |
| 44940.895833333336 | 0.75 |
| 44940.90625 | 0.98 |
| 44940.916666666664 | 1.34 |
| 44940.927083333336 | 1.41 |
| 44940.9375 | 1.24 |
| 44940.947916666664 | 1.26 |
| 44940.958333333336 | 1.24 |
| 44940.96875 | 1.28 |
| 44940.979166666664 | 1.3 |
| 44940.989583333336 | 1.31 |
| 44941.0 | 1.48 |
| 44941.010416666664 | 1.48 |
| 44941.020833333336 | 1.54 |
| 44941.03125 | 1.78 |
| 44941.041666666664 | 2.18 |
| 44941.052083333336 | 1.79 |
| 44941.0625 | 1.91 |
| 44941.072916666664 | 1.83 |
| 44941.083333333336 | 1.72 |
| 44941.09375 | 1.5 |
| 44941.104166666664 | 1.88 |
| 44941.114583333336 | 1.44 |
| 44941.125 | 1.44 |
| 44941.135416666664 | 1.32 |
| 44941.145833333336 | 1.33 |
| 44941.15625 | 1.33 |
| 44941.166666666664 | 1.26 |
| 44941.177083333336 | 1.09 |
| 44941.1875 | 1.16 |
| 44941.197916666664 | 1.31 |
| 44941.208333333336 | 1.2 |
| 44941.21875 | 1.16 |
| 44941.229166666664 | 1.26 |
| 44941.239583333336 | 1.39 |
| 44941.25 | 1.3 |
| 44941.260416666664 | 1.18 |
| 44941.270833333336 | 1.29 |
| 44941.28125 | 1.39 |
| 44941.291666666664 | 1.44 |
| 44941.302083333336 | 1.7 |
| 44941.3125 | 1.92 |
| 44941.322916666664 | 1.6 |
| 44941.333333333336 | 2.27 |
| 44941.34375 | 1.81 |
| 44941.354166666664 | 2.03 |
| 44941.364583333336 | 1.8 |
| 44941.375 | 1.69 |
| 44941.385416666664 | 1.98 |
| 44941.395833333336 | 1.89 |
| 44941.40625 | 1.49 |
| 44941.416666666664 | 1.47 |
| 44941.427083333336 | 1.33 |
| 44941.4375 | 1.39 |
| 44941.447916666664 | 1.22 |
| 44941.458333333336 | 1.19 |
| 44941.46875 | 1.13 |
| 44941.479166666664 | 1.16 |
| 44941.489583333336 | 1.27 |
| 44941.5 | 1.38 |
| 44941.510416666664 | 1.42 |
| 44941.520833333336 | 1.4 |
| 44941.53125 | 1.72 |
| 44941.541666666664 | 1.63 |
| 44941.552083333336 | 1.57 |
| 44941.5625 | 1.21 |
| 44941.572916666664 | 1.31 |
| 44941.583333333336 | 0.99 |
| 44941.59375 | 0.73 |
| 44941.604166666664 | 0.79 |
| 44941.614583333336 | 0.69 |
| 44941.625 | 0.64 |
| 44941.635416666664 | 0.73 |
| 44941.645833333336 | 0.61 |
| 44941.65625 | 0.64 |
| 44941.666666666664 | 0.62 |
| 44941.677083333336 | 0.63 |
| 44941.6875 | 0.67 |
| 44941.697916666664 | 0.55 |
| 44941.708333333336 | 0.67 |
| 44941.71875 | 0.67 |
| 44941.729166666664 | 0.69 |
| 44941.739583333336 | 0.62 |
| 44941.75 | 0.6 |
| 44941.760416666664 | 0.61 |
| 44941.770833333336 | 0.67 |
| 44941.78125 | 0.86 |
| 44941.791666666664 | 0.86 |
| 44941.802083333336 | 1.37 |
| 44941.8125 | 1.21 |
| 44941.822916666664 | 1.69 |
| 44941.833333333336 | 1.52 |
| 44941.84375 | 1.58 |
| 44941.854166666664 | 1.65 |
| 44941.864583333336 | 1.63 |
| 44941.875 | 1.7 |
| 44941.885416666664 | 1.61 |
| 44941.895833333336 | 1.67 |
| 44941.90625 | 1.56 |
| 44941.916666666664 | 1.72 |
| 44941.927083333336 | 1.73 |
| 44941.9375 | 1.66 |
| 44941.947916666664 | 3.81 |
| 44941.958333333336 | 2.1 |
| 44941.96875 | 2.51 |
| 44941.979166666664 | 2.6 |
| 44941.989583333336 | 3.43 |
| 44942.0 | 2.26 |
| 44942.010416666664 | 3.3 |
| 44942.020833333336 | 2.84 |
| 44942.03125 | 2.82 |
| 44942.041666666664 | 3.19 |
| 44942.052083333336 | 3.25 |
| 44942.0625 | 3.29 |
| 44942.072916666664 | 2.48 |
| 44942.083333333336 | 2.19 |
| 44942.09375 | 2.46 |
| 44942.104166666664 | 1.97 |
| 44942.114583333336 | 2.27 |
| 44942.125 | 74.03 |
| 44942.135416666664 | 2.1 |
| 44942.145833333336 | 2.06 |
| 44942.15625 | 1.88 |
| 44942.166666666664 | 1.97 |
| 44942.177083333336 | 1.81 |
| 44942.1875 | 1.95 |
| 44942.197916666664 | 1.92 |
| 44942.208333333336 | 1.93 |
| 44942.21875 | 1.88 |
| 44942.229166666664 | 2.01 |
| 44942.239583333336 | 1.77 |
| 44942.25 | 2.11 |
| 44942.260416666664 | 1.96 |
| 44942.270833333336 | 2.29 |
| 44942.28125 | 2.11 |
| 44942.291666666664 | 2.19 |
| 44942.302083333336 | 2.36 |
| 44942.3125 | 5.13 |
| 44942.322916666664 | 40.31 |
| 44942.333333333336 | 7.92 |
| 44942.34375 | 3.6 |
| 44942.354166666664 | 3.05 |
| 44942.364583333336 | 144.1 |
| 44942.375 | 439.87 |
| 44942.385416666664 | 627.17 |
| 44942.395833333336 | 3.81 |
| 44942.40625 | 253.73 |
| 44942.416666666664 | 4.18 |
| 44942.427083333336 | 205.93 |
| 44942.4375 | 205.49 |
| 44942.447916666664 | 143.24 |
| 44942.458333333336 | 2.79 |
| 44942.46875 | 2.66 |
| 44942.479166666664 | 2.28 |
| 44942.489583333336 | 1.84 |
| 44942.5 | 1.58 |
| 44942.510416666664 | 1.82 |
| 44942.520833333336 | 1.64 |
| 44942.53125 | 1.72 |
| 44942.541666666664 | 1.48 |
| 44942.552083333336 | 1.41 |
| 44942.5625 | 1.09 |
| 44942.572916666664 | 0.86 |
| 44942.583333333336 | 0.77 |
| 44942.59375 | 0.83 |
| 44942.604166666664 | 0.76 |
| 44942.614583333336 | 0.67 |
| 44942.625 | 0.75 |
| 44942.635416666664 | 0.87 |
| 44942.645833333336 | 0.79 |
| 44942.65625 | 0.77 |
| 44942.666666666664 | 0.72 |
| 44942.677083333336 | 0.71 |
| 44942.6875 | 0.7 |
| 44942.697916666664 | 0.64 |
| 44942.708333333336 | 0.64 |
| 44942.71875 | 0.67 |
| 44942.729166666664 | 0.65 |
| 44942.739583333336 | 1.11 |
| 44942.75 | 0.78 |
| 44942.760416666664 | 0.59 |
| 44942.770833333336 | 1.02 |
| 44942.78125 | 0.71 |
| 44942.791666666664 | 0.63 |
| 44942.802083333336 | 0.79 |
| 44942.8125 | 0.83 |
| 44942.822916666664 | 0.96 |
| 44942.833333333336 | 1.11 |
| 44942.84375 | 0.96 |
| 44942.854166666664 | 1.05 |
| 44942.864583333336 | 1.12 |
| 44942.875 | 1.78 |
| 44942.885416666664 | 2.13 |
| 44942.895833333336 | 1.82 |
| 44942.90625 | 1.84 |
| 44942.916666666664 | 2.01 |
| 44942.927083333336 | 1.81 |
| 44942.9375 | 1.91 |
| 44942.947916666664 | 2.06 |
| 44942.958333333336 | 1.89 |
| 44942.96875 | 1.93 |
| 44942.979166666664 | 1.97 |
| 44942.989583333336 | 1.81 |
| 44943.0 | 1.74 |
| 44943.010416666664 | 1.79 |
| 44943.020833333336 | 1.73 |
| 44943.03125 | 1.7 |
| 44943.041666666664 | 1.86 |
| 44943.052083333336 | 1.94 |
| 44943.0625 | 1.91 |
| 44943.072916666664 | 2.06 |
| 44943.083333333336 | 2.01 |
| 44943.09375 | 2.09 |
| 44943.104166666664 | 2.62 |
| 44943.114583333336 | 2.06 |
| 44943.125 | 2.45 |
| 44943.135416666664 | 2.24 |
| 44943.145833333336 | 2.16 |
| 44943.15625 | 2.43 |
| 44943.166666666664 | 2.28 |
| 44943.177083333336 | 2.28 |
| 44943.1875 | 2.12 |
| 44943.197916666664 | 2.05 |
| 44943.208333333336 | 1.92 |
| 44943.21875 | 2.05 |
| 44943.229166666664 | 1.84 |
| 44943.239583333336 | 2.99 |
| 44943.25 | 1.79 |
| 44943.260416666664 | 1.78 |
| 44943.270833333336 | 1.78 |
| 44943.28125 | 1.86 |
| 44943.291666666664 | 1.82 |
| 44943.302083333336 | 1.88 |
| 44943.3125 | 1.98 |
| 44943.322916666664 | 2 |
| 44943.333333333336 | 2.35 |
| 44943.34375 | 2.05 |
| 44943.354166666664 | 2.21 |
| 44943.364583333336 | 2.37 |
| 44943.375 | 21.63 |
| 44943.385416666664 | 3.69 |
| 44943.395833333336 | 3.12 |
| 44943.40625 | 2.9 |
| 44943.416666666664 | 2.46 |
| 44943.427083333336 | 2.19 |
| 44943.4375 | 2.36 |
| 44943.447916666664 | 2.25 |
| 44943.458333333336 | 2.06 |
| 44943.46875 | 1.95 |
| 44943.479166666664 | 1.93 |
| 44943.489583333336 | 1.81 |
| 44943.5 | 1.68 |
| 44943.510416666664 | 1.76 |
| 44943.520833333336 | 1.68 |
| 44943.53125 | 1.74 |
| 44943.541666666664 | 1.57 |
| 44943.552083333336 | 1.9 |
| 44943.5625 | 1.8 |
| 44943.572916666664 | 1.59 |
| 44943.583333333336 | 1.87 |
| 44943.59375 | 1.84 |
| 44943.604166666664 | 1.32 |
| 44943.614583333336 | 1.43 |
| 44943.625 | 1.64 |
| 44943.635416666664 | 1.94 |
| 44943.645833333336 | 2.15 |
| 44943.65625 | 2.18 |
| 44943.666666666664 | 2.35 |
| 44943.677083333336 | 2.34 |
| 44943.6875 | 2.46 |
| 44943.697916666664 | 2.39 |
| 44943.708333333336 | 2.65 |
| 44943.71875 | 2.15 |
| 44943.729166666664 | 2.19 |
| 44943.739583333336 | 1.62 |
| 44943.75 | 1.94 |
| 44943.760416666664 | 1.75 |
| 44943.770833333336 | 1.88 |
| 44943.78125 | 1.71 |
| 44943.791666666664 | 1.65 |
| 44943.802083333336 | 1.89 |
| 44943.8125 | 1.85 |
| 44943.822916666664 | 1.83 |
| 44943.833333333336 | 1.92 |
| 44943.84375 | 1.97 |
| 44943.854166666664 | 2.25 |
| 44943.864583333336 | 1.97 |
| 44943.875 | 2.05 |
| 44943.885416666664 | 1.88 |
| 44943.895833333336 | 2.03 |
| 44943.90625 | 2.4 |
| 44943.916666666664 | 2.33 |
| 44943.927083333336 | 2.23 |
| 44943.9375 | 2.33 |
| 44943.947916666664 | 2.18 |
| 44943.958333333336 | 1.85 |
| 44943.96875 | 2.17 |
| 44943.979166666664 | 1.94 |
| 44943.989583333336 | 1.85 |
| 44944.0 | 2.1 |
| 44944.010416666664 | 2.1 |
| 44944.020833333336 | 1.99 |
| 44944.03125 | 2.3 |
| 44944.041666666664 | 2.55 |
| 44944.052083333336 | 2.73 |
| 44944.0625 | 2.68 |
| 44944.072916666664 | 2.69 |
| 44944.083333333336 | 2.73 |
| 44944.09375 | 2.85 |
| 44944.104166666664 | 2.85 |
| 44944.114583333336 | 2.92 |
| 44944.125 | 3.07 |
| 44944.135416666664 | 3.43 |
| 44944.145833333336 | 3.6 |
| 44944.15625 | 3.7 |
| 44944.166666666664 | 3.33 |
| 44944.177083333336 | 3.62 |
| 44944.1875 | 3.42 |
| 44944.197916666664 | 3.5 |
| 44944.208333333336 | 3.08 |
| 44944.21875 | 3.53 |
| 44944.229166666664 | 3.12 |
| 44944.239583333336 | 3.49 |
| 44944.25 | 6.92 |
| 44944.260416666664 | 4.06 |
| 44944.270833333336 | 2.72 |
| 44944.28125 | 3.03 |
| 44944.291666666664 | 3.53 |
| 44944.302083333336 | 3.63 |
| 44944.3125 | 2.75 |
| 44944.322916666664 | 2.69 |
| 44944.333333333336 | 2.68 |
| 44944.34375 | 2.45 |
| 44944.354166666664 | 2.87 |
| 44944.364583333336 | 2.58 |
| 44944.375 | 2.76 |
| 44944.385416666664 | 2.31 |
| 44944.395833333336 | 1.99 |
| 44944.40625 | 3.08 |
| 44944.416666666664 | 2.35 |
| 44944.427083333336 | 3.67 |
| 44944.4375 | 3.24 |
| 44944.447916666664 | 2.18 |
| 44944.458333333336 | 2.65 |
| 44944.46875 | 2.15 |
| 44944.479166666664 | 2.08 |
| 44944.489583333336 | 2.2 |
| 44944.5 | 3.29 |
| 44944.510416666664 | 3.55 |
| 44944.520833333336 | 3.22 |
| 44944.53125 | 1.96 |
| 44944.541666666664 | 1.55 |
| 44944.552083333336 | 1.95 |
| 44944.5625 | 3.05 |
| 44944.572916666664 | 110.12 |
| 44944.583333333336 | 8.51 |
| 44944.59375 | 8.26 |
| 44944.604166666664 | 7.4 |
| 44944.614583333336 | 11.91 |
| 44944.625 | 14.24 |
| 44944.635416666664 | 6.88 |
| 44944.645833333336 | 8.93 |
| 44944.65625 | 12.09 |
| 44944.666666666664 | 9.45 |
| 44944.677083333336 | 4.27 |
| 44944.6875 | 8.84 |
| 44944.697916666664 | 1.24 |
| 44944.708333333336 | 0.97 |
| 44944.71875 | 1.01 |
| 44944.729166666664 | 1.27 |
| 44944.739583333336 | 1.18 |
| 44944.75 | 1.3 |
| 44944.760416666664 | 1.26 |
| 44944.770833333336 | 3.38 |
| 44944.78125 | 0.83 |
| 44944.791666666664 | 0.92 |
| 44944.802083333336 | 0.91 |
| 44944.8125 | 1.06 |
| 44944.822916666664 | 1.8 |
| 44944.833333333336 | 1.52 |
| 44944.84375 | 1.44 |
| 44944.854166666664 | 1.5 |
| 44944.864583333336 | 1.86 |
| 44944.875 | 1.94 |
| 44944.885416666664 | 1.71 |
| 44944.895833333336 | 1.75 |
| 44944.90625 | 1.96 |
| 44944.916666666664 | 1.93 |
| 44944.927083333336 | 2.45 |
| 44944.9375 | 2.72 |
| 44944.947916666664 | 2.43 |
| 44944.958333333336 | 2.6 |
| 44944.96875 | 2.24 |
| 44944.979166666664 | 1.84 |
| 44944.989583333336 | 1.98 |
| 44945.0 | 1.87 |
| 44945.010416666664 | 2.05 |
| 44945.020833333336 | 2.06 |
| 44945.03125 | 2.08 |
| 44945.041666666664 | 36.22 |
| 44945.052083333336 | 3.01 |
| 44945.0625 | 3.46 |
| 44945.072916666664 | 18.78 |
| 44945.083333333336 | 11.62 |
| 44945.09375 | 4.83 |
| 44945.104166666664 | 5.78 |
| 44945.114583333336 | 4.18 |
| 44945.125 | 4.46 |
| 44945.135416666664 | 4.44 |
| 44945.145833333336 | 4.4 |
| 44945.15625 | 4.51 |
| 44945.166666666664 | 5.32 |
| 44945.177083333336 | 6.26 |
| 44945.1875 | 6.36 |
| 44945.197916666664 | 6.48 |
| 44945.208333333336 | 5.5 |
| 44945.21875 | 6.19 |
| 44945.229166666664 | 5.36 |
| 44945.239583333336 | 5.41 |
| 44945.25 | 4.92 |
| 44945.260416666664 | 4.19 |
| 44945.270833333336 | 3.79 |
| 44945.28125 | 3 |
| 44945.291666666664 | 2.53 |
| 44945.302083333336 | 2.16 |
| 44945.3125 | 1.81 |
| 44945.322916666664 | 1.93 |
| 44945.333333333336 | 1.44 |
| 44945.34375 | 1.48 |
| 44945.354166666664 | 1.44 |
| 44945.364583333336 | 1.66 |
| 44945.375 | 2.21 |
| 44945.385416666664 | 2.48 |
| 44945.395833333336 | 2.29 |
| 44945.40625 | 2.36 |
| 44945.416666666664 | 2.32 |
| 44945.427083333336 | 2.39 |
| 44945.4375 | 2.12 |
| 44945.447916666664 | 2.25 |
| 44945.458333333336 | 2.49 |
| 44945.46875 | 2.79 |
| 44945.479166666664 | 488.08 |
| 44945.489583333336 | 2.38 |
| 44945.5 | 12.71 |
| 44945.510416666664 | 54.18 |
| 44945.520833333336 | 18.7 |
| 44945.53125 | 16.86 |
| 44945.541666666664 | 5.24 |
| 44945.552083333336 | 10.53 |
| 44945.5625 | 5.14 |
| 44945.572916666664 | 128.36 |
| 44945.583333333336 | 15.07 |
| 44945.59375 | 4.49 |
| 44945.604166666664 | 4.59 |
| 44945.614583333336 | 0.93 |
| 44945.625 | 1.08 |
| 44945.635416666664 | 1.51 |
| 44945.645833333336 | 1.67 |
| 44945.65625 | 0.89 |
| 44945.666666666664 | 0.72 |
| 44945.677083333336 | 1.3 |
| 44945.6875 | 2.04 |
| 44945.697916666664 | 1.7 |
| 44945.708333333336 | 2.24 |
| 44945.71875 | 1.11 |
| 44945.729166666664 | 2.69 |
| 44945.739583333336 | 2.71 |
| 44945.75 | 2.62 |
| 44945.760416666664 | 3.46 |
| 44945.770833333336 | 3.09 |
| 44945.78125 | 3.58 |
| 44945.791666666664 | 3.37 |
| 44945.802083333336 | 2.84 |
| 44945.8125 | 2.66 |
| 44945.822916666664 | 2.36 |
| 44945.833333333336 | 2.35 |
| 44945.84375 | 2.35 |
| 44945.854166666664 | 1.99 |
| 44945.864583333336 | 2.01 |
| 44945.875 | 1.98 |
| 44945.885416666664 | 1.88 |
| 44945.895833333336 | 1.73 |
| 44945.90625 | 1.93 |
| 44945.916666666664 | 1.67 |
| 44945.927083333336 | 1.93 |
| 44945.9375 | 2 |
| 44945.947916666664 | 2.76 |
| 44945.958333333336 | 2.26 |
| 44945.96875 | 2.95 |
| 44945.979166666664 | 2.32 |
| 44945.989583333336 | 2.1 |
| 44946.0 | 2.09 |
| 44946.010416666664 | 1.9 |
| 44946.020833333336 | 1.96 |
| 44946.03125 | 1.64 |
| 44946.041666666664 | 1.75 |
| 44946.052083333336 | 1.77 |
| 44946.0625 | 1.75 |
| 44946.072916666664 | 1.71 |
| 44946.083333333336 | 1.96 |
| 44946.09375 | 1.76 |
| 44946.104166666664 | 1.86 |
| 44946.114583333336 | 2.46 |
| 44946.125 | 2.7 |
| 44946.135416666664 | 3.17 |
| 44946.145833333336 | 3.14 |
| 44946.15625 | 3.52 |
| 44946.166666666664 | 3.36 |
| 44946.177083333336 | 3.91 |
| 44946.1875 | 3.72 |
| 44946.197916666664 | 4.03 |
| 44946.208333333336 | 4.05 |
| 44946.21875 | 5.18 |
| 44946.229166666664 | 5.38 |
| 44946.239583333336 | 5.53 |
| 44946.25 | 5.59 |
| 44946.260416666664 | 5.48 |
| 44946.270833333336 | 5.23 |
| 44946.28125 | 4.33 |
| 44946.291666666664 | 4.04 |
| 44946.302083333336 | 3.21 |
| 44946.3125 | 2.55 |
| 44946.322916666664 | 2.64 |
| 44946.333333333336 | 1.9 |
| 44946.34375 | 1.65 |
| 44946.354166666664 | 1.35 |
| 44946.364583333336 | 1.36 |
| 44946.375 | 1.23 |
| 44946.385416666664 | 1.41 |
| 44946.395833333336 | 1.33 |
| 44946.40625 | 1.63 |
| 44946.416666666664 | 1.78 |
| 44946.427083333336 | 2.36 |
| 44946.4375 | 1.68 |
| 44946.447916666664 | 1.64 |
| 44946.458333333336 | 1.64 |
| 44946.46875 | 1.82 |
| 44946.479166666664 | 1.86 |
| 44946.489583333336 | 2.06 |
| 44946.5 | 2.47 |
| 44946.510416666664 | 3.09 |
| 44946.520833333336 | 2.15 |
| 44946.53125 | 1.87 |
| 44946.541666666664 | 1.44 |
| 44946.552083333336 | 1.53 |
| 44946.5625 | 1.33 |
| 44946.572916666664 | 1.39 |
| 44946.583333333336 | 1.24 |
| 44946.59375 | 0.79 |
| 44946.604166666664 | 204.84 |
| 44946.614583333336 | 5.05 |
| 44946.625 | 13.76 |
| 44946.635416666664 | 69.75 |
| 44946.645833333336 | 10.65 |
| 44946.65625 | 24.28 |
| 44946.666666666664 | 27.82 |
| 44946.677083333336 | 50.95 |
| 44946.6875 | 35.95 |
| 44946.697916666664 | 23.73 |
| 44946.708333333336 | 349.56 |
| 44946.71875 | 111.65 |
| 44946.729166666664 | 17.94 |
| 44946.739583333336 | 11.09 |
| 44946.75 | 14.31 |
| 44946.760416666664 | 13.59 |
| 44946.770833333336 | 3.04 |
| 44946.78125 | 1.52 |
| 44946.791666666664 | 1.96 |
| 44946.802083333336 | 2.72 |
| 44946.8125 | 3.62 |
| 44946.822916666664 | 3.21 |
| 44946.833333333336 | 2.75 |
| 44946.84375 | 2.5 |
| 44946.854166666664 | 2.18 |
| 44946.864583333336 | 2.93 |
| 44946.875 | 2.37 |
| 44946.885416666664 | 2.15 |
| 44946.895833333336 | 1.71 |
| 44946.90625 | 1.56 |
| 44946.916666666664 | 1.34 |
| 44946.927083333336 | 1.34 |
| 44946.9375 | 1.46 |
| 44946.947916666664 | 1.64 |
| 44946.958333333336 | 1.58 |
| 44946.96875 | 1.75 |
| 44946.979166666664 | 2.06 |
| 44946.989583333336 | 2.31 |
| 44947.0 | 2.05 |
| 44947.010416666664 | 2.08 |
| 44947.020833333336 | 1.75 |
| 44947.03125 | 2.03 |
| 44947.041666666664 | 1.82 |
| 44947.052083333336 | 1.8 |
| 44947.0625 | 1.52 |
| 44947.072916666664 | 1.67 |
| 44947.083333333336 | 2.53 |
| 44947.09375 | 2.03 |
| 44947.104166666664 | 1.93 |
| 44947.114583333336 | 1.39 |
| 44947.125 | 1.64 |
| 44947.135416666664 | 3.18 |
| 44947.145833333336 | 2.71 |
| 44947.15625 | 2.04 |
| 44947.166666666664 | 2.62 |
| 44947.177083333336 | 2.83 |
| 44947.1875 | 2.9 |
| 44947.197916666664 | 2.92 |
| 44947.208333333336 | 3.11 |
| 44947.21875 | 3.06 |
| 44947.229166666664 | 3.33 |
| 44947.239583333336 | 3.8 |
| 44947.25 | 4.08 |
| 44947.260416666664 | 4.36 |
| 44947.270833333336 | 4.47 |
| 44947.28125 | 4.32 |
| 44947.291666666664 | 3.85 |
| 44947.302083333336 | 3.77 |
| 44947.3125 | 3.81 |
| 44947.322916666664 | 3.35 |
| 44947.333333333336 | 3.31 |
| 44947.34375 | 3.07 |
| 44947.354166666664 | 2.59 |
| 44947.364583333336 | 2.51 |
| 44947.375 | 2.3 |
| 44947.385416666664 | 1.9 |
| 44947.395833333336 | 1.73 |
| 44947.40625 | 1.56 |
| 44947.416666666664 | 1.98 |
| 44947.427083333336 | 1.84 |
| 44947.4375 | 1.96 |
| 44947.447916666664 | 1.89 |
| 44947.458333333336 | 2.06 |
| 44947.46875 | 2.29 |
| 44947.479166666664 | 2.05 |
| 44947.489583333336 | 2.05 |
| 44947.5 | 2 |
| 44947.510416666664 | 2.14 |
| 44947.520833333336 | 2.35 |
| 44947.53125 | 2.28 |
| 44947.541666666664 | 2.29 |
| 44947.552083333336 | 2.68 |
| 44947.5625 | 2.46 |
| 44947.572916666664 | 1 |
| 44947.583333333336 | 0.93 |
| 44947.59375 | 1.35 |
| 44947.604166666664 | 0.7 |
| 44947.614583333336 | 1.13 |
| 44947.625 | 0.6 |
| 44947.635416666664 | 1.52 |
| 44947.645833333336 | 1.24 |
| 44947.65625 | 1.21 |
| 44947.666666666664 | 0.49 |
| 44947.677083333336 | 41.65 |
| 44947.6875 | 123.4 |
| 44947.697916666664 | 91.82 |
| 44947.708333333336 | 0.72 |
| 44947.71875 | 0.75 |
| 44947.729166666664 | 1.19 |
| 44947.739583333336 | 1.11 |
| 44947.75 | 1.06 |
| 44947.760416666664 | 1.17 |
| 44947.770833333336 | 1.08 |
| 44947.78125 | 1.14 |
| 44947.791666666664 | 1.3 |
| 44947.802083333336 | 3.17 |
| 44947.8125 | 1.96 |
| 44947.822916666664 | 2.47 |
| 44947.833333333336 | 3.21 |
| 44947.84375 | 3.26 |
| 44947.854166666664 | 4.2 |
| 44947.864583333336 | 3.42 |
| 44947.875 | 2.85 |
| 44947.885416666664 | 2.74 |
| 44947.895833333336 | 2.35 |
| 44947.90625 | 2.37 |
| 44947.916666666664 | 1.82 |
| 44947.927083333336 | 1.63 |
| 44947.9375 | 1.51 |
| 44947.947916666664 | 1.56 |
| 44947.958333333336 | 1.59 |
| 44947.96875 | 1.98 |
| 44947.979166666664 | 2.05 |
| 44947.989583333336 | 2.29 |
| 44948.0 | 2.49 |
| 44948.010416666664 | 2.7 |
| 44948.020833333336 | 2.64 |
| 44948.03125 | 3.08 |
| 44948.041666666664 | 3.03 |
| 44948.052083333336 | 2.92 |
| 44948.0625 | 3.86 |
| 44948.072916666664 | 2.46 |
| 44948.083333333336 | 3.76 |
| 44948.09375 | 2.39 |
| 44948.104166666664 | 2.2 |
| 44948.114583333336 | 1.89 |
| 44948.125 | 1.62 |
| 44948.135416666664 | 1.86 |
| 44948.145833333336 | 1.71 |
| 44948.15625 | 1.84 |
| 44948.166666666664 | 623.65 |
| 44948.177083333336 | 617.53 |
| 44948.1875 | 4.87 |
| 44948.197916666664 | 2.04 |
| 44948.208333333336 | 2.09 |
| 44948.21875 | 1.63 |
| 44948.229166666664 | 1.77 |
| 44948.239583333336 | 1.87 |
| 44948.25 | 2.09 |
| 44948.260416666664 | 2.21 |
| 44948.270833333336 | 2.1 |
| 44948.28125 | 2.32 |
| 44948.291666666664 | 2.24 |
| 44948.302083333336 | 2.43 |
| 44948.3125 | 3.12 |
| 44948.322916666664 | 2.79 |
| 44948.333333333336 | 2.41 |
| 44948.34375 | 3.13 |
| 44948.354166666664 | 2.73 |
| 44948.364583333336 | 2.35 |
| 44948.375 | 2.64 |
| 44948.385416666664 | 2.01 |
| 44948.395833333336 | 1.9 |
| 44948.40625 | 1.42 |
| 44948.416666666664 | 1.65 |
| 44948.427083333336 | 1.53 |
| 44948.4375 | 1.58 |
| 44948.447916666664 | 1.51 |
| 44948.458333333336 | 1.48 |
| 44948.46875 | 1.72 |
| 44948.479166666664 | 1.83 |
| 44948.489583333336 | 2.03 |
| 44948.5 | 2.07 |
| 44948.510416666664 | 2.18 |
| 44948.520833333336 | 2.01 |
| 44948.53125 | 1.68 |
| 44948.541666666664 | 1.52 |
| 44948.552083333336 | 2.64 |
| 44948.5625 | 2.19 |
| 44948.572916666664 | 2.41 |
| 44948.583333333336 | 2.45 |
| 44948.59375 | 3.32 |
| 44948.604166666664 | 2.28 |
| 44948.614583333336 | 2.02 |
| 44948.625 | 1.6 |
| 44948.635416666664 | 2 |
| 44948.645833333336 | 1.85 |
| 44948.65625 | 1.61 |
| 44948.666666666664 | 1.61 |
| 44948.677083333336 | 1.63 |
| 44948.6875 | 1.55 |
| 44948.697916666664 | 1.5 |
| 44948.708333333336 | 1.33 |
| 44948.71875 | 1.55 |
| 44948.729166666664 | 1.39 |
| 44948.739583333336 | 1.82 |
| 44948.75 | 1.63 |
| 44948.760416666664 | 1.52 |
| 44948.770833333336 | 2.27 |
| 44948.78125 | 2.52 |
| 44948.791666666664 | 2.47 |
| 44948.802083333336 | 3 |
| 44948.8125 | 3.21 |
| 44948.822916666664 | 3.52 |
| 44948.833333333336 | 3.65 |
| 44948.84375 | 3.7 |
| 44948.854166666664 | 4.14 |
| 44948.864583333336 | 4 |
| 44948.875 | 3.51 |
| 44948.885416666664 | 3.75 |
| 44948.895833333336 | 3.65 |
| 44948.90625 | 3.53 |
| 44948.916666666664 | 3.24 |
| 44948.927083333336 | 3 |
| 44948.9375 | 2.45 |
| 44948.947916666664 | 2.23 |
| 44948.958333333336 | 2.53 |
| 44948.96875 | 2.3 |
| 44948.979166666664 | 2.17 |
| 44948.989583333336 | 2.25 |
| 44949.0 | 2.18 |
| 44949.010416666664 | 2.33 |
| 44949.020833333336 | 2.44 |
| 44949.03125 | 2.72 |
| 44949.041666666664 | 2.49 |
| 44949.052083333336 | 2.63 |
| 44949.0625 | 2.7 |
| 44949.072916666664 | 2.56 |
| 44949.083333333336 | 2.22 |
| 44949.09375 | 2.88 |
| 44949.104166666664 | 2.71 |
| 44949.114583333336 | 2.33 |
| 44949.125 | 2.07 |
| 44949.135416666664 | 2 |
| 44949.145833333336 | 2.02 |
| 44949.15625 | 1.71 |
| 44949.166666666664 | 1.75 |
| 44949.177083333336 | 1.96 |
| 44949.1875 | 1.74 |
| 44949.197916666664 | 1.77 |
| 44949.208333333336 | 3.64 |
| 44949.21875 | 1.83 |
| 44949.229166666664 | 1.9 |
| 44949.239583333336 | 8.79 |
| 44949.25 | 2 |
| 44949.260416666664 | 2.09 |
| 44949.270833333336 | 2.19 |
| 44949.28125 | 1.98 |
| 44949.291666666664 | 2.28 |
| 44949.302083333336 | 2.48 |
| 44949.3125 | 2.55 |
| 44949.322916666664 | 2.56 |
| 44949.333333333336 | 2.49 |
| 44949.34375 | 4.78 |
| 44949.354166666664 | 3.06 |
| 44949.364583333336 | 2.96 |
| 44949.375 | 3.23 |
| 44949.385416666664 | 3.22 |
| 44949.395833333336 | 3.03 |
| 44949.40625 | 2.39 |
| 44949.416666666664 | 2.37 |
| 44949.427083333336 | 1.92 |
| 44949.4375 | 1.71 |
| 44949.447916666664 | 1.71 |
| 44949.458333333336 | 1.67 |
| 44949.46875 | 1.72 |
| 44949.479166666664 | 1.69 |
| 44949.489583333336 | 1.65 |
| 44949.5 | 1.73 |
| 44949.510416666664 | 2.12 |
| 44949.520833333336 | 1.82 |
| 44949.53125 | 1.96 |
| 44949.541666666664 | 2.04 |
| 44949.552083333336 | 1.79 |
| 44949.5625 | 1.76 |
| 44949.572916666664 | 1.71 |
| 44949.583333333336 | 1.39 |
| 44949.59375 | 1.59 |
| 44949.604166666664 | 1.22 |
| 44949.614583333336 | 1.01 |
| 44949.625 | 1.66 |
| 44949.635416666664 | 1.36 |
| 44949.645833333336 | 0.96 |
| 44949.65625 | 1.05 |
| 44949.666666666664 | 0.57 |
| 44949.677083333336 | 0.66 |
| 44949.6875 | 0.41 |
| 44949.697916666664 | 0.6 |
| 44949.708333333336 | 0.69 |
| 44949.71875 | 0.2 |
| 44949.729166666664 | 0.57 |
| 44949.739583333336 | 10.51 |
| 44949.75 | 2.27 |
| 44949.760416666664 | 2.12 |
| 44949.770833333336 | 276.35 |
| 44949.78125 | 218.78 |
| 44949.791666666664 | 543.41 |
| 44949.802083333336 | 60.57 |
| 44949.8125 | 61.41 |
| 44949.822916666664 | 79.66 |
| 44949.833333333336 | 15.79 |
| 44949.84375 | 35.58 |
| 44949.854166666664 | 15.4 |
| 44949.864583333336 | 93.21 |
| 44949.875 | 4.75 |
| 44949.885416666664 | 3.38 |
| 44949.895833333336 | 3.2 |
| 44949.90625 | 3.03 |
| 44949.916666666664 | 3.36 |
| 44949.927083333336 | 3.29 |
| 44949.9375 | 3.42 |
| 44949.947916666664 | 3.15 |
| 44949.958333333336 | 2.63 |
| 44949.96875 | 2.32 |
| 44949.979166666664 | 2.42 |
| 44949.989583333336 | 2.32 |
| 44950.0 | 2.16 |
| 44950.010416666664 | 2.27 |
| 44950.020833333336 | 2.16 |
| 44950.03125 | 2.22 |
| 44950.041666666664 | 2.42 |
| 44950.052083333336 | 2.36 |
| 44950.0625 | 3.14 |
| 44950.072916666664 | 2.36 |
| 44950.083333333336 | 2.39 |
| 44950.09375 | 2.26 |
| 44950.104166666664 | 2.45 |
| 44950.114583333336 | 2.23 |
| 44950.125 | 2.47 |
| 44950.135416666664 | 2.29 |
| 44950.145833333336 | 2.03 |
| 44950.15625 | 1.97 |
| 44950.166666666664 | 1.85 |
| 44950.177083333336 | 1.81 |
| 44950.1875 | 1.68 |
| 44950.197916666664 | 1.59 |
| 44950.208333333336 | 1.48 |
| 44950.21875 | 1.7 |
| 44950.229166666664 | 1.95 |
| 44950.239583333336 | 522.84 |
| 44950.25 | 563.66 |
| 44950.260416666664 | 26.37 |
| 44950.270833333336 | 2.25 |
| 44950.28125 | 2.24 |
| 44950.291666666664 | 1.98 |
| 44950.302083333336 | 2.12 |
| 44950.3125 | 2.23 |
| 44950.322916666664 | 2.05 |
| 44950.333333333336 | 2.29 |
| 44950.34375 | 2.33 |
| 44950.354166666664 | 2.41 |
| 44950.364583333336 | 2.33 |
| 44950.375 | 2.33 |
| 44950.385416666664 | 2.41 |
| 44950.395833333336 | 2.65 |
| 44950.40625 | 2.59 |
| 44950.416666666664 | 2.63 |
| 44950.427083333336 | 2.53 |
| 44950.4375 | 2.72 |
| 44950.447916666664 | 2.58 |
| 44950.458333333336 | 2.22 |
| 44950.46875 | 2.03 |
| 44950.479166666664 | 2 |
| 44950.489583333336 | 1.91 |
| 44950.5 | 2.45 |
| 44950.510416666664 | 2.02 |
| 44950.520833333336 | 1.85 |
| 44950.53125 | 1.7 |
| 44950.541666666664 | 1.46 |
| 44950.552083333336 | 1.17 |
| 44950.5625 | 0.9 |
| 44950.572916666664 | 0.96 |
| 44950.583333333336 | 0.72 |
| 44950.59375 | 0.64 |
| 44950.604166666664 | 0.5 |
| 44950.614583333336 | 0.4 |
| 44950.625 | 0.54 |
| 44950.635416666664 | 0.43 |
| 44950.645833333336 | 0.67 |
| 44950.65625 | 0.48 |
| 44950.666666666664 | 0.4 |
| 44950.677083333336 | 0.32 |
| 44950.6875 | 0.41 |
| 44950.697916666664 | 0.36 |
| 44950.708333333336 | 0.41 |
| 44950.71875 | 0.62 |
| 44950.729166666664 | 0.52 |
| 44950.739583333336 | 0.35 |
| 44950.75 | 1.16 |
| 44950.760416666664 | 1.71 |
| 44950.770833333336 | 2.6 |
| 44950.78125 | 1.12 |
| 44950.791666666664 | 1.28 |
| 44950.802083333336 | 135.11 |
| 44950.8125 | 34.43 |
| 44950.822916666664 | 0.99 |
| 44950.833333333336 | 1.04 |
| 44950.84375 | 1.17 |
| 44950.854166666664 | 1.59 |
| 44950.864583333336 | 1.69 |
| 44950.875 | 1.95 |
| 44950.885416666664 | 2.14 |
| 44950.895833333336 | 2.35 |
| 44950.90625 | 2.28 |
| 44950.916666666664 | 2.49 |
| 44950.927083333336 | 2.2 |
| 44950.9375 | 2.56 |
| 44950.947916666664 | 2.61 |
| 44950.958333333336 | 3.05 |
| 44950.96875 | 2.98 |
| 44950.979166666664 | 4.78 |
| 44950.989583333336 | 3.2 |
| 44951.0 | 2.55 |
| 44951.010416666664 | 1.89 |
| 44951.020833333336 | 2.16 |
| 44951.03125 | 1.69 |
| 44951.041666666664 | 1.5 |
| 44951.052083333336 | 1.49 |
| 44951.0625 | 1.61 |
| 44951.072916666664 | 1.4 |
| 44951.083333333336 | 1.3 |
| 44951.09375 | 1.51 |
| 44951.104166666664 | 1.74 |
| 44951.114583333336 | 1.74 |
| 44951.125 | 1.87 |
| 44951.135416666664 | 1.7 |
| 44951.145833333336 | 1.69 |
| 44951.15625 | 1.76 |
| 44951.166666666664 | 2.09 |
| 44951.177083333336 | 2.31 |
| 44951.1875 | 1.41 |
| 44951.197916666664 | 1.43 |
| 44951.208333333336 | 1.58 |
| 44951.21875 | 1.48 |
| 44951.229166666664 | 1.25 |
| 44951.239583333336 | 1.33 |
| 44951.25 | 1.18 |
| 44951.260416666664 | 4.19 |
| 44951.270833333336 | 1.36 |
| 44951.28125 | 1.36 |
| 44951.291666666664 | 1.35 |
| 44951.302083333336 | 1.59 |
| 44951.3125 | 1.55 |
| 44951.322916666664 | 1.67 |
| 44951.333333333336 | 1.69 |
| 44951.34375 | 1.64 |
| 44951.354166666664 | 1.74 |
| 44951.364583333336 | 1.74 |
| 44951.375 | 1.66 |
| 44951.385416666664 | 1.65 |
| 44951.395833333336 | 2.16 |
| 44951.40625 | 1.87 |
| 44951.416666666664 | 2.24 |
| 44951.427083333336 | 2.41 |
| 44951.4375 | 2.11 |
| 44951.447916666664 | 458.16 |
| 44951.458333333336 | 2.09 |
| 44951.46875 | 2.29 |
| 44951.479166666664 | 2.01 |
| 44951.489583333336 | 2.06 |
| 44951.5 | 1.92 |
| 44951.510416666664 | 1.89 |
| 44951.520833333336 | 1.85 |
| 44951.53125 | 1.67 |
| 44951.541666666664 | 1.36 |
| 44951.552083333336 | 1.34 |
| 44951.5625 | 1.12 |
| 44951.572916666664 | 1.16 |
| 44951.583333333336 | 1.03 |
| 44951.59375 | 0.91 |
| 44951.604166666664 | 0.93 |
| 44951.614583333336 | 0.97 |
| 44951.625 | 1.63 |
| 44951.635416666664 | 1.19 |
| 44951.645833333336 | 1.33 |
| 44951.65625 | 1.18 |
| 44951.666666666664 | 1.31 |
| 44951.677083333336 | 1.14 |
| 44951.6875 | 1.06 |
| 44951.697916666664 | 1.2 |
| 44951.708333333336 | 1.44 |
| 44951.71875 | 1.27 |
| 44951.729166666664 | 1.27 |
| 44951.739583333336 | 1.33 |
| 44951.75 | 1.34 |
| 44951.760416666664 | 1.5 |
| 44951.770833333336 | 1.45 |
| 44951.78125 | 1.35 |
| 44951.791666666664 | 1.38 |
| 44951.802083333336 | 1.39 |
| 44951.8125 | 1.47 |
| 44951.822916666664 | 205.19 |
| 44951.833333333336 | 22.08 |
| 44951.84375 | 1.76 |
| 44951.854166666664 | 1.89 |
| 44951.864583333336 | 1.93 |
| 44951.875 | 2.21 |
| 44951.885416666664 | 2.31 |
| 44951.895833333336 | 2.4 |
| 44951.90625 | 2.51 |
| 44951.916666666664 | 2.7 |
| 44951.927083333336 | 2.6 |
| 44951.9375 | 2.75 |
| 44951.947916666664 | 3.39 |
| 44951.958333333336 | 2.69 |
| 44951.96875 | 2.9 |
| 44951.979166666664 | 2.43 |
| 44951.989583333336 | 2.45 |
| 44952.0 | 2.5 |
| 44952.010416666664 | 2.79 |
| 44952.020833333336 | 2.96 |
| 44952.03125 | 3.49 |
| 44952.041666666664 | 3.48 |
| 44952.052083333336 | 3.9 |
| 44952.0625 | 3.39 |
| 44952.072916666664 | 4.49 |
| 44952.083333333336 | 3.09 |
| 44952.09375 | 4.13 |
| 44952.104166666664 | 3.09 |
| 44952.114583333336 | 617.02 |
| 44952.125 | 3.18 |
| 44952.135416666664 | 2.92 |
| 44952.145833333336 | 124.05 |
| 44952.15625 | 612.45 |
| 44952.166666666664 | 607.84 |
| 44952.177083333336 | 3.03 |
| 44952.1875 | 2.61 |
| 44952.197916666664 | 2.58 |
| 44952.208333333336 | 3.5 |
| 44952.21875 | 2.76 |
| 44952.229166666664 | 2.44 |
| 44952.239583333336 | 1.96 |
| 44952.25 | 1.95 |
| 44952.260416666664 | 1.67 |
| 44952.270833333336 | 1.71 |
| 44952.28125 | 1.6 |
| 44952.291666666664 | 1.82 |
| 44952.302083333336 | 1.76 |
| 44952.3125 | 1.9 |
| 44952.322916666664 | 2.02 |
| 44952.333333333336 | 2.1 |
| 44952.34375 | 2.33 |
| 44952.354166666664 | 2.52 |
| 44952.364583333336 | 2.48 |
| 44952.375 | 2.67 |
| 44952.385416666664 | 2.66 |
| 44952.395833333336 | 2.57 |
| 44952.40625 | 2.87 |
| 44952.416666666664 | 2.69 |
| 44952.427083333336 | 2.75 |
| 44952.4375 | 2.61 |
| 44952.447916666664 | 2.55 |
| 44952.458333333336 | 2.68 |
| 44952.46875 | 3.76 |
| 44952.479166666664 | 2.78 |
| 44952.489583333336 | 2.97 |
| 44952.5 | 2.93 |
| 44952.510416666664 | 3.08 |
| 44952.520833333336 | 2.82 |
| 44952.53125 | 3.3 |
| 44952.541666666664 | 2.65 |
| 44952.552083333336 | 2.06 |
| 44952.5625 | 1.93 |
| 44952.572916666664 | 1.79 |
| 44952.583333333336 | 1.51 |
| 44952.59375 | 1.34 |
| 44952.604166666664 | 1.02 |
| 44952.614583333336 | 0.97 |
| 44952.625 | 0.82 |
| 44952.635416666664 | 0.85 |
| 44952.645833333336 | 0.82 |
| 44952.65625 | 0.72 |
| 44952.666666666664 | 0.62 |
| 44952.677083333336 | 0.58 |
| 44952.6875 | 0.53 |
| 44952.697916666664 | 0.54 |
| 44952.708333333336 | 0.49 |
| 44952.71875 | 0.58 |
| 44952.729166666664 | 0.71 |
| 44952.739583333336 | 0.86 |
| 44952.75 | 0.95 |
| 44952.760416666664 | 0.52 |
| 44952.770833333336 | 0.59 |
| 44952.78125 | 0.42 |
| 44952.791666666664 | 0.83 |
| 44952.802083333336 | 0.96 |
| 44952.8125 | 0.85 |
| 44952.822916666664 | 0.9 |
| 44952.833333333336 | 1.42 |
| 44952.84375 | 1.84 |
| 44952.854166666664 | 2.23 |
| 44952.864583333336 | 2.43 |
| 44952.875 | 2.4 |
| 44952.885416666664 | 2.63 |
| 44952.895833333336 | 2.67 |
| 44952.90625 | 2.59 |
| 44952.916666666664 | 2.51 |
| 44952.927083333336 | 2.59 |
| 44952.9375 | 2.77 |
| 44952.947916666664 | 2.85 |
| 44952.958333333336 | 3.16 |
| 44952.96875 | 3.09 |
| 44952.979166666664 | 3.77 |
| 44952.989583333336 | 3.82 |
| 44953.0 | 3.28 |
| 44953.010416666664 | 3.43 |
| 44953.020833333336 | 3.25 |
| 44953.03125 | 3.85 |
| 44953.041666666664 | 2.94 |
| 44953.052083333336 | 2.76 |
| 44953.0625 | 2.72 |
| 44953.072916666664 | 2.78 |
| 44953.083333333336 | 2.4 |
| 44953.09375 | 2.8 |
| 44953.104166666664 | 2.03 |
| 44953.114583333336 | 2.01 |
| 44953.125 | 1.73 |
| 44953.135416666664 | 1.59 |
| 44953.145833333336 | 1.49 |
| 44953.15625 | 1.32 |
| 44953.166666666664 | 1.46 |
| 44953.177083333336 | 1.66 |
| 44953.1875 | 1.75 |
| 44953.197916666664 | 1.58 |
| 44953.208333333336 | 1.93 |
| 44953.21875 | 2.33 |
| 44953.229166666664 | 1.72 |
| 44953.239583333336 | 1.88 |
| 44953.25 | 1.55 |
| 44953.260416666664 | 2.05 |
| 44953.270833333336 | 1.6 |
| 44953.28125 | 1.54 |
| 44953.291666666664 | 1.41 |
| 44953.302083333336 | 1.39 |
| 44953.3125 | 1.43 |
| 44953.322916666664 | 1.26 |
| 44953.333333333336 | 1.26 |
| 44953.34375 | 1.47 |
| 44953.354166666664 | 1.61 |
| 44953.364583333336 | 1.64 |
| 44953.375 | 1.62 |
| 44953.385416666664 | 1.73 |
| 44953.395833333336 | 1.89 |
| 44953.40625 | 1.83 |
| 44953.416666666664 | 2.07 |
| 44953.427083333336 | 2.22 |
| 44953.4375 | 2.3 |
| 44953.447916666664 | 2.38 |
| 44953.458333333336 | 2.55 |
| 44953.46875 | 2.77 |
| 44953.479166666664 | 2.76 |
| 44953.489583333336 | 3 |
| 44953.5 | 3.01 |
| 44953.510416666664 | 3.67 |
| 44953.520833333336 | 3.95 |
| 44953.53125 | 3.47 |
| 44953.541666666664 | 3.2 |
| 44953.552083333336 | 3.2 |
| 44953.5625 | 2.96 |
| 44953.572916666664 | 2.41 |
| 44953.583333333336 | 1.99 |
| 44953.59375 | 1.68 |
| 44953.604166666664 | 1.3 |
| 44953.614583333336 | 1.05 |
| 44953.625 | 0.93 |
| 44953.635416666664 | 0.69 |
| 44953.645833333336 | 0.51 |
| 44953.65625 | 0.45 |
| 44953.666666666664 | 0.37 |
| 44953.677083333336 | 0.47 |
| 44953.6875 | 0.33 |
| 44953.697916666664 | 0.25 |
| 44953.708333333336 | 0.3 |
| 44953.71875 | 0.43 |
| 44953.729166666664 | 0.42 |
| 44953.739583333336 | 0.38 |
| 44953.75 | 0.45 |
| 44953.760416666664 | 0.64 |
| 44953.770833333336 | 0.84 |
| 44953.78125 | 0.53 |
| 44953.791666666664 | 0.51 |
| 44953.802083333336 | 0.59 |
| 44953.8125 | 0.47 |
| 44953.822916666664 | 0.41 |
| 44953.833333333336 | 0.62 |
| 44953.84375 | 0.62 |
| 44953.854166666664 | 0.74 |
| 44953.864583333336 | 1.35 |
| 44953.875 | 1.79 |
| 44953.885416666664 | 2.4 |
| 44953.895833333336 | 2.52 |
| 44953.90625 | 2.59 |
| 44953.916666666664 | 2.43 |
| 44953.927083333336 | 2.65 |
| 44953.9375 | 2.75 |
| 44953.947916666664 | 2.92 |
| 44953.958333333336 | 3.22 |
| 44953.96875 | 3.09 |
| 44953.979166666664 | 3.2 |
| 44953.989583333336 | 3.36 |
| 44954.0 | 2.77 |
| 44954.010416666664 | 3.72 |
| 44954.020833333336 | 3.44 |
| 44954.03125 | 4.06 |
| 44954.041666666664 | 4 |
| 44954.052083333336 | 3.75 |
| 44954.0625 | 4.24 |
| 44954.072916666664 | 3.26 |
| 44954.083333333336 | 2.91 |
| 44954.09375 | 3.42 |
| 44954.104166666664 | 2.85 |
| 44954.114583333336 | 2.21 |
| 44954.125 | 1.87 |
| 44954.135416666664 | 1.81 |
| 44954.145833333336 | 1.58 |
| 44954.15625 | 1.38 |
| 44954.166666666664 | 1.27 |
| 44954.177083333336 | 0.81 |
| 44954.1875 | 0.81 |
| 44954.197916666664 | 0.97 |
| 44954.208333333336 | 1.08 |
| 44954.21875 | 1.01 |
| 44954.229166666664 | 1.05 |
| 44954.239583333336 | 1.19 |
| 44954.25 | 1.24 |
| 44954.260416666664 | 1.7 |
| 44954.270833333336 | 1.56 |
| 44954.28125 | 1.16 |
| 44954.291666666664 | 1.78 |
| 44954.302083333336 | 1.34 |
| 44954.3125 | 1.26 |
| 44954.322916666664 | 1.03 |
| 44954.333333333336 | 1.17 |
| 44954.34375 | 1.05 |
| 44954.354166666664 | 1.07 |
| 44954.364583333336 | 2.21 |
| 44954.375 | 1.77 |
| 44954.385416666664 | 2.26 |
| 44954.395833333336 | 4.27 |
| 44954.40625 | 1.35 |
| 44954.416666666664 | 1.34 |
| 44954.427083333336 | 1.45 |
| 44954.4375 | 1.59 |
| 44954.447916666664 | 1.78 |
| 44954.458333333336 | 1.75 |
| 44954.46875 | 1.86 |
| 44954.479166666664 | 1.84 |
| 44954.489583333336 | 2.07 |
| 44954.5 | 2.09 |
| 44954.510416666664 | 2.33 |
| 44954.520833333336 | 2.2 |
| 44954.53125 | 2.39 |
| 44954.541666666664 | 2.48 |
| 44954.552083333336 | 2.52 |
| 44954.5625 | 2.36 |
| 44954.572916666664 | 2.01 |
| 44954.583333333336 | 1.63 |
| 44954.59375 | 1.48 |
| 44954.604166666664 | 1.03 |
| 44954.614583333336 | 0.99 |
| 44954.625 | 0.84 |
| 44954.635416666664 | 0.89 |
| 44954.645833333336 | 0.72 |
| 44954.65625 | 0.46 |
| 44954.666666666664 | 0.36 |
| 44954.677083333336 | 0.4 |
| 44954.6875 | 0.27 |
| 44954.697916666664 | 0.38 |
| 44954.708333333336 | 0.25 |
| 44954.71875 | 0.28 |
| 44954.729166666664 | 0.22 |
| 44954.739583333336 | 0.22 |
| 44954.75 | 0.2 |
| 44954.760416666664 | 0.22 |
| 44954.770833333336 | 0.24 |
| 44954.78125 | 0.27 |
| 44954.791666666664 | 0.44 |
| 44954.802083333336 | 0.62 |
| 44954.8125 | 0.4 |
| 44954.822916666664 | 0.46 |
| 44954.833333333336 | 0.63 |
| 44954.84375 | 0.43 |
| 44954.854166666664 | 0.49 |
| 44954.864583333336 | 0.81 |
| 44954.875 | 0.68 |
| 44954.885416666664 | 1.11 |
| 44954.895833333336 | 1.58 |
| 44954.90625 | 1.67 |
| 44954.916666666664 | 1.91 |
| 44954.927083333336 | 1.85 |
| 44954.9375 | 1.93 |
| 44954.947916666664 | 2.06 |
| 44954.958333333336 | 2.11 |
| 44954.96875 | 2.19 |
| 44954.979166666664 | 2.39 |
| 44954.989583333336 | 2.31 |
| 44955.0 | 2.68 |
| 44955.010416666664 | 3.02 |
| 44955.020833333336 | 3.2 |
| 44955.03125 | 3.73 |
| 44955.041666666664 | 3.78 |
| 44955.052083333336 | 4.18 |
| 44955.0625 | 3.46 |
| 44955.072916666664 | 3.43 |
| 44955.083333333336 | 3.95 |
| 44955.09375 | 3.4 |
| 44955.104166666664 | 3.55 |
| 44955.114583333336 | 2.62 |
| 44955.125 | 2.1 |
| 44955.135416666664 | 1.88 |
| 44955.145833333336 | 1.8 |
| 44955.15625 | 1.65 |
| 44955.166666666664 | 1.46 |
| 44955.177083333336 | 1.1 |
| 44955.1875 | 0.82 |
| 44955.197916666664 | 0.81 |
| 44955.208333333336 | 2.08 |
| 44955.21875 | 0.67 |
| 44955.229166666664 | 0.5 |
| 44955.239583333336 | 0.72 |
| 44955.25 | 0.91 |
| 44955.260416666664 | 0.75 |
| 44955.270833333336 | 1.13 |
| 44955.28125 | 0.95 |
| 44955.291666666664 | 0.94 |
| 44955.302083333336 | 1.07 |
| 44955.3125 | 0.89 |
| 44955.322916666664 | 1.15 |
| 44955.333333333336 | 1.12 |
| 44955.34375 | 0.76 |
| 44955.354166666664 | 0.77 |
| 44955.364583333336 | 0.85 |
| 44955.375 | 0.83 |
| 44955.385416666664 | 0.84 |
| 44955.395833333336 | 0.9 |
| 44955.40625 | 1.07 |
| 44955.416666666664 | 0.77 |
| 44955.427083333336 | 0.76 |
| 44955.4375 | 0.88 |
| 44955.447916666664 | 0.9 |
| 44955.458333333336 | 0.97 |
| 44955.46875 | 1.09 |
| 44955.479166666664 | 1.08 |
| 44955.489583333336 | 1.3 |
| 44955.5 | 1.55 |
| 44955.510416666664 | 1.5 |
| 44955.520833333336 | 1.82 |
| 44955.53125 | 2.04 |
| 44955.541666666664 | 2.1 |
| 44955.552083333336 | 2.2 |
| 44955.5625 | 2.34 |
| 44955.572916666664 | 2.54 |
| 44955.583333333336 | 2.36 |
| 44955.59375 | 1.5 |
| 44955.604166666664 | 1.32 |
| 44955.614583333336 | 1.19 |
| 44955.625 | 1.03 |
| 44955.635416666664 | 0.87 |
| 44955.645833333336 | 0.85 |
| 44955.65625 | 0.63 |
| 44955.666666666664 | 0.93 |
| 44955.677083333336 | 0.43 |
| 44955.6875 | 0.24 |
| 44955.697916666664 | 0.32 |
| 44955.708333333336 | 0.4 |
| 44955.71875 | 0.48 |
| 44955.729166666664 | 0.47 |
| 44955.739583333336 | 0.55 |
| 44955.75 | 0.78 |
| 44955.760416666664 | 0.66 |
| 44955.770833333336 | 0.64 |
| 44955.78125 | 0.59 |
| 44955.791666666664 | 0.64 |
| 44955.802083333336 | 0.7 |
| 44955.8125 | 0.67 |
| 44955.822916666664 | 0.79 |
| 44955.833333333336 | 1.08 |
| 44955.84375 | 0.84 |
| 44955.854166666664 | 0.91 |
| 44955.864583333336 | 0.81 |
| 44955.875 | 0.85 |
| 44955.885416666664 | 0.71 |
| 44955.895833333336 | 0.86 |
| 44955.90625 | 0.96 |
| 44955.916666666664 | 1.15 |
| 44955.927083333336 | 0.94 |
| 44955.9375 | 0.97 |
| 44955.947916666664 | 1.35 |
| 44955.958333333336 | 1.22 |
| 44955.96875 | 1.36 |
| 44955.979166666664 | 1.51 |
| 44955.989583333336 | 1.41 |
| 44956.0 | 1.64 |
| 44956.010416666664 | 1.7 |
| 44956.020833333336 | 1.99 |
| 44956.03125 | 1.91 |
| 44956.041666666664 | 2.24 |
| 44956.052083333336 | 2.64 |
| 44956.0625 | 2.68 |
| 44956.072916666664 | 2.92 |
| 44956.083333333336 | 3.92 |
| 44956.09375 | 2.61 |
| 44956.104166666664 | 3 |
| 44956.114583333336 | 2.78 |
| 44956.125 | 2.44 |
| 44956.135416666664 | 2.43 |
| 44956.145833333336 | 1.95 |
| 44956.15625 | 1.81 |
| 44956.166666666664 | 1.39 |
| 44956.177083333336 | 1.28 |
| 44956.1875 | 1.12 |
| 44956.197916666664 | 0.95 |
| 44956.208333333336 | 0.97 |
| 44956.21875 | 0.68 |
| 44956.229166666664 | 0.68 |
| 44956.239583333336 | 0.67 |
| 44956.25 | 0.67 |
| 44956.260416666664 | 0.62 |
| 44956.270833333336 | 0.55 |
| 44956.28125 | 0.51 |
| 44956.291666666664 | 0.68 |
| 44956.302083333336 | 0.83 |
| 44956.3125 | 1.25 |
| 44956.322916666664 | 0.91 |
| 44956.333333333336 | 0.98 |
| 44956.34375 | 1.58 |
| 44956.354166666664 | 1.39 |
| 44956.364583333336 | 1.01 |
| 44956.375 | 1.36 |
| 44956.385416666664 | 1.17 |
| 44956.395833333336 | 1.05 |
| 44956.40625 | 1.09 |
| 44956.416666666664 | 0.74 |
| 44956.427083333336 | 0.89 |
| 44956.4375 | 0.66 |
| 44956.447916666664 | 0.72 |
| 44956.458333333336 | 0.88 |
| 44956.46875 | 0.8 |
| 44956.479166666664 | 0.73 |
| 44956.489583333336 | 0.65 |
| 44956.5 | 0.79 |
| 44956.510416666664 | 0.87 |
| 44956.520833333336 | 0.89 |
| 44956.53125 | 1.03 |
| 44956.541666666664 | 1.06 |
| 44956.552083333336 | 1.27 |
| 44956.5625 | 1.47 |
| 44956.572916666664 | 1.52 |
| 44956.583333333336 | 1.67 |
| 44956.59375 | 1.83 |
| 44956.604166666664 | 2.06 |
| 44956.614583333336 | 2.48 |
| 44956.625 | 2.1 |
| 44956.635416666664 | 2.14 |
| 44956.645833333336 | 2.25 |
| 44956.65625 | 2.69 |
| 44956.666666666664 | 1.97 |
| 44956.677083333336 | 2.1 |
| 44956.6875 | 1.58 |
| 44956.697916666664 | 1.62 |
| 44956.708333333336 | 1.26 |
| 44956.71875 | 0.83 |
| 44956.729166666664 | 0.91 |
| 44956.739583333336 | 0.52 |
| 44956.75 | 0.54 |
| 44956.760416666664 | 0.3 |
| 44956.770833333336 | 0.53 |
| 44956.78125 | 0.49 |
| 44956.791666666664 | 0.54 |
| 44956.802083333336 | 0.52 |
| 44956.8125 | 0.8 |
| 44956.822916666664 | 1.27 |
| 44956.833333333336 | 0.47 |
| 44956.84375 | 0.94 |
| 44956.854166666664 | 0.88 |
| 44956.864583333336 | 1.14 |
| 44956.875 | 1.14 |
| 44956.885416666664 | 0.95 |
| 44956.895833333336 | 0.92 |
| 44956.90625 | 1.09 |
| 44956.916666666664 | 1.05 |
| 44956.927083333336 | 1.23 |
| 44956.9375 | 1.17 |
| 44956.947916666664 | 1.17 |
| 44956.958333333336 | 1.16 |
| 44956.96875 | 1.2 |
| 44956.979166666664 | 1.14 |
| 44956.989583333336 | 1.1 |
| 44957.0 | 1.19 |
| 44957.010416666664 | 1.39 |
| 44957.020833333336 | 1.93 |
| 44957.03125 | 2.1 |
| 44957.041666666664 | 2.66 |
| 44957.052083333336 | 3.09 |
| 44957.0625 | 3.23 |
| 44957.072916666664 | 3.78 |
| 44957.083333333336 | 3.71 |
| 44957.09375 | 4.44 |
| 44957.104166666664 | 5.78 |
| 44957.114583333336 | 4.97 |
| 44957.125 | 4.54 |
| 44957.135416666664 | 3.94 |
| 44957.145833333336 | 4.3 |
| 44957.15625 | 4.22 |
| 44957.166666666664 | 3.35 |
| 44957.177083333336 | 2.47 |
| 44957.1875 | 2.14 |
| 44957.197916666664 | 2.08 |
| 44957.208333333336 | 1.7 |
| 44957.21875 | 1.35 |
| 44957.229166666664 | 1.15 |
| 44957.239583333336 | 1.1 |
| 44957.25 | 1.08 |
| 44957.260416666664 | 0.91 |
| 44957.270833333336 | 0.91 |
| 44957.28125 | 0.79 |
| 44957.291666666664 | 0.64 |
| 44957.302083333336 | 0.75 |
| 44957.3125 | 0.7 |
| 44957.322916666664 | 0.86 |
| 44957.333333333336 | 0.79 |
| 44957.34375 | 0.7 |
| 44957.354166666664 | 0.96 |
| 44957.364583333336 | 1.17 |
| 44957.375 | 0.88 |
| 44957.385416666664 | 0.96 |
| 44957.395833333336 | 0.92 |
| 44957.40625 | 0.96 |
| 44957.416666666664 | 1.2 |
| 44957.427083333336 | 0.94 |
| 44957.4375 | 0.88 |
| 44957.447916666664 | 1.03 |
| 44957.458333333336 | 0.7 |
| 44957.46875 | 0.71 |
| 44957.479166666664 | 0.85 |
| 44957.489583333336 | 0.74 |
| 44957.5 | 0.79 |
| 44957.510416666664 | 0.78 |
| 44957.520833333336 | 0.69 |
| 44957.53125 | 0.72 |
| 44957.541666666664 | 0.81 |
| 44957.552083333336 | 1.04 |
| 44957.5625 | 1.23 |
| 44957.572916666664 | 1.46 |
| 44957.583333333336 | 1.88 |
| 44957.59375 | 2.37 |
| 44957.604166666664 | 2.54 |
| 44957.614583333336 | 3.04 |
| 44957.625 | 2.9 |
| 44957.635416666664 | 3.28 |
| 44957.645833333336 | 3.08 |
| 44957.65625 | 3.21 |
| 44957.666666666664 | 4.23 |
| 44957.677083333336 | 4.32 |
| 44957.6875 | 5.63 |
| 44957.697916666664 | 5.91 |
| 44957.708333333336 | 3.67 |
| 44957.71875 | 10.93 |
| 44957.729166666664 | 2.1 |
| 44957.739583333336 | 2.74 |
| 44957.75 | 1.89 |
| 44957.760416666664 | 2.27 |
| 44957.770833333336 | 2.75 |
| 44957.78125 | 2.75 |
| 44957.791666666664 | 1.76 |
| 44957.802083333336 | 1.45 |
| 44957.8125 | 1.31 |
| 44957.822916666664 | 1.21 |
| 44957.833333333336 | 1.17 |
| 44957.84375 | 1.16 |
| 44957.854166666664 | 1 |
| 44957.864583333336 | 1.07 |
| 44957.875 | 0.91 |
| 44957.885416666664 | 0.99 |
| 44957.895833333336 | 0.98 |
| 44957.90625 | 1.12 |
| 44957.916666666664 | 0.94 |
| 44957.927083333336 | 1.09 |
| 44957.9375 | 1.1 |
| 44957.947916666664 | 1.23 |
| 44957.958333333336 | 1.27 |
| 44957.96875 | 1.37 |
| 44957.979166666664 | 1.38 |
| 44957.989583333336 | 1.63 |
| 44958.0 | 1.78 |
| 44958.010416666664 | 1.99 |
| 44958.020833333336 | 2.1 |
| 44958.03125 | 2.24 |
| 44958.041666666664 | 2.81 |
| 44958.052083333336 | 2.71 |
| 44958.0625 | 3.17 |
| 44958.072916666664 | 3.61 |
| 44958.083333333336 | 3.49 |
| 44958.09375 | 3.5 |
| 44958.104166666664 | 3.89 |
| 44958.114583333336 | 4.21 |
| 44958.125 | 4.65 |
| 44958.135416666664 | 4.89 |
| 44958.145833333336 | 5.05 |